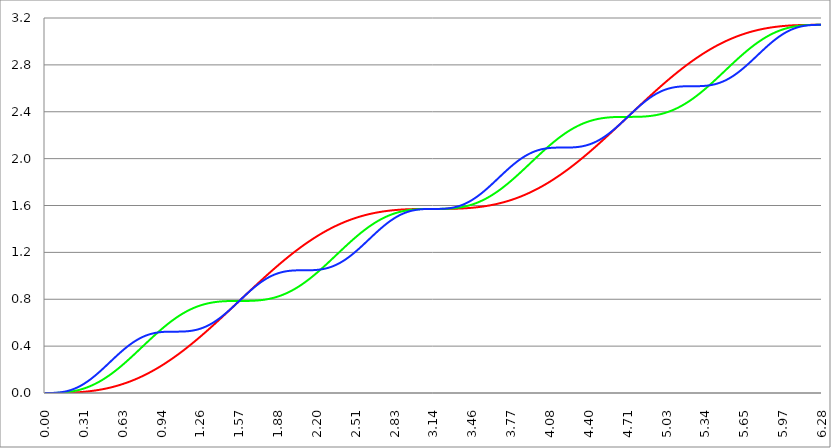
| Category | Series 1 | Series 0 | Series 2 |
|---|---|---|---|
| 0.0 | 0 | 0 | 0 |
| 0.00314159265358979 | 0 | 0 | 0 |
| 0.00628318530717958 | 0 | 0 | 0 |
| 0.00942477796076938 | 0 | 0 | 0 |
| 0.0125663706143592 | 0 | 0 | 0 |
| 0.015707963267949 | 0 | 0 | 0 |
| 0.0188495559215388 | 0 | 0 | 0 |
| 0.0219911485751285 | 0 | 0 | 0 |
| 0.0251327412287183 | 0 | 0 | 0 |
| 0.0282743338823081 | 0 | 0 | 0 |
| 0.0314159265358979 | 0 | 0 | 0 |
| 0.0345575191894877 | 0 | 0 | 0 |
| 0.0376991118430775 | 0 | 0 | 0 |
| 0.0408407044966673 | 0 | 0 | 0 |
| 0.0439822971502571 | 0 | 0 | 0 |
| 0.0471238898038469 | 0 | 0 | 0 |
| 0.0502654824574367 | 0 | 0 | 0 |
| 0.0534070751110265 | 0 | 0 | 0 |
| 0.0565486677646163 | 0 | 0 | 0.001 |
| 0.059690260418206 | 0 | 0 | 0.001 |
| 0.0628318530717958 | 0 | 0 | 0.001 |
| 0.0659734457253856 | 0 | 0 | 0.001 |
| 0.0691150383789754 | 0 | 0 | 0.001 |
| 0.0722566310325652 | 0 | 0.001 | 0.001 |
| 0.075398223686155 | 0 | 0.001 | 0.001 |
| 0.0785398163397448 | 0 | 0.001 | 0.001 |
| 0.0816814089933346 | 0 | 0.001 | 0.002 |
| 0.0848230016469244 | 0 | 0.001 | 0.002 |
| 0.0879645943005142 | 0 | 0.001 | 0.002 |
| 0.091106186954104 | 0 | 0.001 | 0.002 |
| 0.0942477796076937 | 0 | 0.001 | 0.002 |
| 0.0973893722612835 | 0 | 0.001 | 0.003 |
| 0.100530964914873 | 0 | 0.001 | 0.003 |
| 0.103672557568463 | 0 | 0.001 | 0.003 |
| 0.106814150222053 | 0 | 0.002 | 0.004 |
| 0.109955742875643 | 0 | 0.002 | 0.004 |
| 0.113097335529233 | 0 | 0.002 | 0.004 |
| 0.116238928182822 | 0.001 | 0.002 | 0.005 |
| 0.119380520836412 | 0.001 | 0.002 | 0.005 |
| 0.122522113490002 | 0.001 | 0.002 | 0.005 |
| 0.125663706143592 | 0.001 | 0.003 | 0.006 |
| 0.128805298797181 | 0.001 | 0.003 | 0.006 |
| 0.131946891450771 | 0.001 | 0.003 | 0.007 |
| 0.135088484104361 | 0.001 | 0.003 | 0.007 |
| 0.138230076757951 | 0.001 | 0.003 | 0.008 |
| 0.141371669411541 | 0.001 | 0.004 | 0.008 |
| 0.14451326206513 | 0.001 | 0.004 | 0.009 |
| 0.14765485471872 | 0.001 | 0.004 | 0.009 |
| 0.15079644737231 | 0.001 | 0.004 | 0.01 |
| 0.1539380400259 | 0.001 | 0.005 | 0.01 |
| 0.15707963267949 | 0.001 | 0.005 | 0.011 |
| 0.160221225333079 | 0.001 | 0.005 | 0.012 |
| 0.163362817986669 | 0.001 | 0.006 | 0.012 |
| 0.166504410640259 | 0.002 | 0.006 | 0.013 |
| 0.169646003293849 | 0.002 | 0.006 | 0.014 |
| 0.172787595947439 | 0.002 | 0.007 | 0.015 |
| 0.175929188601028 | 0.002 | 0.007 | 0.015 |
| 0.179070781254618 | 0.002 | 0.007 | 0.016 |
| 0.182212373908208 | 0.002 | 0.008 | 0.017 |
| 0.185353966561798 | 0.002 | 0.008 | 0.018 |
| 0.188495559215388 | 0.002 | 0.009 | 0.019 |
| 0.191637151868977 | 0.002 | 0.009 | 0.02 |
| 0.194778744522567 | 0.002 | 0.01 | 0.021 |
| 0.197920337176157 | 0.003 | 0.01 | 0.022 |
| 0.201061929829747 | 0.003 | 0.01 | 0.023 |
| 0.204203522483336 | 0.003 | 0.011 | 0.024 |
| 0.207345115136926 | 0.003 | 0.011 | 0.025 |
| 0.210486707790516 | 0.003 | 0.012 | 0.026 |
| 0.213628300444106 | 0.003 | 0.013 | 0.027 |
| 0.216769893097696 | 0.003 | 0.013 | 0.028 |
| 0.219911485751285 | 0.004 | 0.014 | 0.029 |
| 0.223053078404875 | 0.004 | 0.014 | 0.03 |
| 0.226194671058465 | 0.004 | 0.015 | 0.032 |
| 0.229336263712055 | 0.004 | 0.015 | 0.033 |
| 0.232477856365645 | 0.004 | 0.016 | 0.034 |
| 0.235619449019234 | 0.004 | 0.017 | 0.036 |
| 0.238761041672824 | 0.004 | 0.017 | 0.037 |
| 0.241902634326414 | 0.005 | 0.018 | 0.038 |
| 0.245044226980004 | 0.005 | 0.019 | 0.04 |
| 0.248185819633594 | 0.005 | 0.019 | 0.041 |
| 0.251327412287183 | 0.005 | 0.02 | 0.042 |
| 0.254469004940773 | 0.005 | 0.021 | 0.044 |
| 0.257610597594363 | 0.006 | 0.022 | 0.045 |
| 0.260752190247953 | 0.006 | 0.022 | 0.047 |
| 0.263893782901543 | 0.006 | 0.023 | 0.049 |
| 0.267035375555132 | 0.006 | 0.024 | 0.05 |
| 0.270176968208722 | 0.006 | 0.025 | 0.052 |
| 0.273318560862312 | 0.007 | 0.026 | 0.054 |
| 0.276460153515902 | 0.007 | 0.026 | 0.055 |
| 0.279601746169492 | 0.007 | 0.027 | 0.057 |
| 0.282743338823082 | 0.007 | 0.028 | 0.059 |
| 0.285884931476671 | 0.008 | 0.029 | 0.06 |
| 0.289026524130261 | 0.008 | 0.03 | 0.062 |
| 0.292168116783851 | 0.008 | 0.031 | 0.064 |
| 0.295309709437441 | 0.008 | 0.032 | 0.066 |
| 0.298451302091031 | 0.009 | 0.033 | 0.068 |
| 0.30159289474462 | 0.009 | 0.034 | 0.07 |
| 0.30473448739821 | 0.009 | 0.035 | 0.072 |
| 0.3078760800518 | 0.01 | 0.036 | 0.074 |
| 0.31101767270539 | 0.01 | 0.037 | 0.076 |
| 0.31415926535898 | 0.01 | 0.038 | 0.078 |
| 0.31730085801257 | 0.01 | 0.039 | 0.08 |
| 0.320442450666159 | 0.011 | 0.04 | 0.082 |
| 0.323584043319749 | 0.011 | 0.042 | 0.084 |
| 0.326725635973339 | 0.011 | 0.043 | 0.086 |
| 0.329867228626929 | 0.012 | 0.044 | 0.088 |
| 0.333008821280519 | 0.012 | 0.045 | 0.091 |
| 0.336150413934108 | 0.012 | 0.046 | 0.093 |
| 0.339292006587698 | 0.013 | 0.047 | 0.095 |
| 0.342433599241288 | 0.013 | 0.049 | 0.097 |
| 0.345575191894878 | 0.013 | 0.05 | 0.1 |
| 0.348716784548468 | 0.014 | 0.051 | 0.102 |
| 0.351858377202058 | 0.014 | 0.053 | 0.104 |
| 0.354999969855647 | 0.015 | 0.054 | 0.107 |
| 0.358141562509237 | 0.015 | 0.055 | 0.109 |
| 0.361283155162827 | 0.015 | 0.057 | 0.112 |
| 0.364424747816417 | 0.016 | 0.058 | 0.114 |
| 0.367566340470007 | 0.016 | 0.059 | 0.117 |
| 0.370707933123597 | 0.017 | 0.061 | 0.119 |
| 0.373849525777186 | 0.017 | 0.062 | 0.122 |
| 0.376991118430776 | 0.017 | 0.064 | 0.124 |
| 0.380132711084366 | 0.018 | 0.065 | 0.127 |
| 0.383274303737956 | 0.018 | 0.067 | 0.129 |
| 0.386415896391546 | 0.019 | 0.068 | 0.132 |
| 0.389557489045135 | 0.019 | 0.07 | 0.135 |
| 0.392699081698725 | 0.02 | 0.071 | 0.137 |
| 0.395840674352315 | 0.02 | 0.073 | 0.14 |
| 0.398982267005905 | 0.021 | 0.075 | 0.143 |
| 0.402123859659495 | 0.021 | 0.076 | 0.146 |
| 0.405265452313085 | 0.021 | 0.078 | 0.148 |
| 0.408407044966674 | 0.022 | 0.079 | 0.151 |
| 0.411548637620264 | 0.022 | 0.081 | 0.154 |
| 0.414690230273854 | 0.023 | 0.083 | 0.157 |
| 0.417831822927444 | 0.023 | 0.085 | 0.16 |
| 0.420973415581034 | 0.024 | 0.086 | 0.162 |
| 0.424115008234623 | 0.025 | 0.088 | 0.165 |
| 0.427256600888213 | 0.025 | 0.09 | 0.168 |
| 0.430398193541803 | 0.026 | 0.092 | 0.171 |
| 0.433539786195393 | 0.026 | 0.093 | 0.174 |
| 0.436681378848983 | 0.027 | 0.095 | 0.177 |
| 0.439822971502573 | 0.027 | 0.097 | 0.18 |
| 0.442964564156162 | 0.028 | 0.099 | 0.183 |
| 0.446106156809752 | 0.028 | 0.101 | 0.186 |
| 0.449247749463342 | 0.029 | 0.103 | 0.189 |
| 0.452389342116932 | 0.03 | 0.105 | 0.192 |
| 0.455530934770522 | 0.03 | 0.107 | 0.195 |
| 0.458672527424111 | 0.031 | 0.109 | 0.198 |
| 0.461814120077701 | 0.031 | 0.111 | 0.201 |
| 0.464955712731291 | 0.032 | 0.113 | 0.204 |
| 0.468097305384881 | 0.033 | 0.115 | 0.207 |
| 0.471238898038471 | 0.033 | 0.117 | 0.21 |
| 0.474380490692061 | 0.034 | 0.119 | 0.213 |
| 0.47752208334565 | 0.035 | 0.121 | 0.216 |
| 0.48066367599924 | 0.035 | 0.123 | 0.219 |
| 0.48380526865283 | 0.036 | 0.125 | 0.222 |
| 0.48694686130642 | 0.037 | 0.127 | 0.225 |
| 0.49008845396001 | 0.037 | 0.129 | 0.228 |
| 0.493230046613599 | 0.038 | 0.132 | 0.232 |
| 0.496371639267189 | 0.039 | 0.134 | 0.235 |
| 0.499513231920779 | 0.04 | 0.136 | 0.238 |
| 0.502654824574369 | 0.04 | 0.138 | 0.241 |
| 0.505796417227959 | 0.041 | 0.14 | 0.244 |
| 0.508938009881549 | 0.042 | 0.143 | 0.247 |
| 0.512079602535138 | 0.042 | 0.145 | 0.25 |
| 0.515221195188728 | 0.043 | 0.147 | 0.253 |
| 0.518362787842318 | 0.044 | 0.15 | 0.257 |
| 0.521504380495908 | 0.045 | 0.152 | 0.26 |
| 0.524645973149498 | 0.046 | 0.154 | 0.263 |
| 0.527787565803087 | 0.046 | 0.157 | 0.266 |
| 0.530929158456677 | 0.047 | 0.159 | 0.269 |
| 0.534070751110267 | 0.048 | 0.161 | 0.272 |
| 0.537212343763857 | 0.049 | 0.164 | 0.275 |
| 0.540353936417447 | 0.05 | 0.166 | 0.279 |
| 0.543495529071037 | 0.05 | 0.169 | 0.282 |
| 0.546637121724626 | 0.051 | 0.171 | 0.285 |
| 0.549778714378216 | 0.052 | 0.174 | 0.288 |
| 0.552920307031806 | 0.053 | 0.176 | 0.291 |
| 0.556061899685396 | 0.054 | 0.179 | 0.294 |
| 0.559203492338986 | 0.055 | 0.181 | 0.297 |
| 0.562345084992576 | 0.056 | 0.184 | 0.3 |
| 0.565486677646165 | 0.057 | 0.186 | 0.303 |
| 0.568628270299755 | 0.057 | 0.189 | 0.307 |
| 0.571769862953345 | 0.058 | 0.192 | 0.31 |
| 0.574911455606935 | 0.059 | 0.194 | 0.313 |
| 0.578053048260525 | 0.06 | 0.197 | 0.316 |
| 0.581194640914114 | 0.061 | 0.199 | 0.319 |
| 0.584336233567704 | 0.062 | 0.202 | 0.322 |
| 0.587477826221294 | 0.063 | 0.205 | 0.325 |
| 0.590619418874884 | 0.064 | 0.207 | 0.328 |
| 0.593761011528474 | 0.065 | 0.21 | 0.331 |
| 0.596902604182064 | 0.066 | 0.213 | 0.334 |
| 0.600044196835653 | 0.067 | 0.216 | 0.337 |
| 0.603185789489243 | 0.068 | 0.218 | 0.34 |
| 0.606327382142833 | 0.069 | 0.221 | 0.343 |
| 0.609468974796423 | 0.07 | 0.224 | 0.346 |
| 0.612610567450013 | 0.071 | 0.227 | 0.349 |
| 0.615752160103602 | 0.072 | 0.229 | 0.352 |
| 0.618893752757192 | 0.073 | 0.232 | 0.355 |
| 0.622035345410782 | 0.074 | 0.235 | 0.357 |
| 0.625176938064372 | 0.075 | 0.238 | 0.36 |
| 0.628318530717962 | 0.076 | 0.241 | 0.363 |
| 0.631460123371551 | 0.077 | 0.244 | 0.366 |
| 0.634601716025141 | 0.079 | 0.246 | 0.369 |
| 0.637743308678731 | 0.08 | 0.249 | 0.372 |
| 0.640884901332321 | 0.081 | 0.252 | 0.374 |
| 0.644026493985911 | 0.082 | 0.255 | 0.377 |
| 0.647168086639501 | 0.083 | 0.258 | 0.38 |
| 0.65030967929309 | 0.084 | 0.261 | 0.383 |
| 0.65345127194668 | 0.085 | 0.264 | 0.385 |
| 0.65659286460027 | 0.087 | 0.267 | 0.388 |
| 0.65973445725386 | 0.088 | 0.27 | 0.391 |
| 0.66287604990745 | 0.089 | 0.273 | 0.393 |
| 0.666017642561039 | 0.09 | 0.276 | 0.396 |
| 0.669159235214629 | 0.091 | 0.279 | 0.398 |
| 0.672300827868219 | 0.093 | 0.282 | 0.401 |
| 0.675442420521809 | 0.094 | 0.284 | 0.404 |
| 0.678584013175399 | 0.095 | 0.287 | 0.406 |
| 0.681725605828989 | 0.096 | 0.29 | 0.409 |
| 0.684867198482578 | 0.097 | 0.294 | 0.411 |
| 0.688008791136168 | 0.099 | 0.297 | 0.414 |
| 0.691150383789758 | 0.1 | 0.3 | 0.416 |
| 0.694291976443348 | 0.101 | 0.303 | 0.418 |
| 0.697433569096938 | 0.103 | 0.306 | 0.421 |
| 0.700575161750528 | 0.104 | 0.309 | 0.423 |
| 0.703716754404117 | 0.105 | 0.312 | 0.425 |
| 0.706858347057707 | 0.107 | 0.315 | 0.428 |
| 0.709999939711297 | 0.108 | 0.318 | 0.43 |
| 0.713141532364887 | 0.109 | 0.321 | 0.432 |
| 0.716283125018477 | 0.111 | 0.324 | 0.434 |
| 0.719424717672066 | 0.112 | 0.327 | 0.437 |
| 0.722566310325656 | 0.113 | 0.33 | 0.439 |
| 0.725707902979246 | 0.115 | 0.333 | 0.441 |
| 0.728849495632836 | 0.116 | 0.336 | 0.443 |
| 0.731991088286426 | 0.117 | 0.339 | 0.445 |
| 0.735132680940016 | 0.119 | 0.343 | 0.447 |
| 0.738274273593605 | 0.12 | 0.346 | 0.449 |
| 0.741415866247195 | 0.122 | 0.349 | 0.451 |
| 0.744557458900785 | 0.123 | 0.352 | 0.453 |
| 0.747699051554375 | 0.125 | 0.355 | 0.455 |
| 0.750840644207965 | 0.126 | 0.358 | 0.457 |
| 0.753982236861554 | 0.127 | 0.361 | 0.459 |
| 0.757123829515144 | 0.129 | 0.364 | 0.461 |
| 0.760265422168734 | 0.13 | 0.368 | 0.463 |
| 0.763407014822324 | 0.132 | 0.371 | 0.464 |
| 0.766548607475914 | 0.133 | 0.374 | 0.466 |
| 0.769690200129504 | 0.135 | 0.377 | 0.468 |
| 0.772831792783093 | 0.136 | 0.38 | 0.47 |
| 0.775973385436683 | 0.138 | 0.383 | 0.471 |
| 0.779114978090273 | 0.14 | 0.386 | 0.473 |
| 0.782256570743863 | 0.141 | 0.39 | 0.474 |
| 0.785398163397453 | 0.143 | 0.393 | 0.476 |
| 0.788539756051042 | 0.144 | 0.396 | 0.478 |
| 0.791681348704632 | 0.146 | 0.399 | 0.479 |
| 0.794822941358222 | 0.147 | 0.402 | 0.481 |
| 0.797964534011812 | 0.149 | 0.405 | 0.482 |
| 0.801106126665402 | 0.151 | 0.408 | 0.484 |
| 0.804247719318992 | 0.152 | 0.412 | 0.485 |
| 0.807389311972581 | 0.154 | 0.415 | 0.486 |
| 0.810530904626171 | 0.156 | 0.418 | 0.488 |
| 0.813672497279761 | 0.157 | 0.421 | 0.489 |
| 0.816814089933351 | 0.159 | 0.424 | 0.49 |
| 0.819955682586941 | 0.161 | 0.427 | 0.492 |
| 0.823097275240531 | 0.162 | 0.43 | 0.493 |
| 0.82623886789412 | 0.164 | 0.433 | 0.494 |
| 0.82938046054771 | 0.166 | 0.437 | 0.495 |
| 0.8325220532013 | 0.167 | 0.44 | 0.496 |
| 0.83566364585489 | 0.169 | 0.443 | 0.497 |
| 0.83880523850848 | 0.171 | 0.446 | 0.498 |
| 0.841946831162069 | 0.173 | 0.449 | 0.5 |
| 0.845088423815659 | 0.174 | 0.452 | 0.501 |
| 0.848230016469249 | 0.176 | 0.455 | 0.502 |
| 0.851371609122839 | 0.178 | 0.458 | 0.503 |
| 0.854513201776429 | 0.18 | 0.461 | 0.504 |
| 0.857654794430019 | 0.181 | 0.464 | 0.504 |
| 0.860796387083608 | 0.183 | 0.468 | 0.505 |
| 0.863937979737198 | 0.185 | 0.471 | 0.506 |
| 0.867079572390788 | 0.187 | 0.474 | 0.507 |
| 0.870221165044378 | 0.189 | 0.477 | 0.508 |
| 0.873362757697968 | 0.191 | 0.48 | 0.509 |
| 0.876504350351557 | 0.192 | 0.483 | 0.509 |
| 0.879645943005147 | 0.194 | 0.486 | 0.51 |
| 0.882787535658737 | 0.196 | 0.489 | 0.511 |
| 0.885929128312327 | 0.198 | 0.492 | 0.512 |
| 0.889070720965917 | 0.2 | 0.495 | 0.512 |
| 0.892212313619507 | 0.202 | 0.498 | 0.513 |
| 0.895353906273096 | 0.204 | 0.501 | 0.514 |
| 0.898495498926686 | 0.206 | 0.504 | 0.514 |
| 0.901637091580276 | 0.208 | 0.507 | 0.515 |
| 0.904778684233866 | 0.209 | 0.51 | 0.515 |
| 0.907920276887456 | 0.211 | 0.513 | 0.516 |
| 0.911061869541045 | 0.213 | 0.516 | 0.516 |
| 0.914203462194635 | 0.215 | 0.519 | 0.517 |
| 0.917345054848225 | 0.217 | 0.522 | 0.517 |
| 0.920486647501815 | 0.219 | 0.525 | 0.518 |
| 0.923628240155405 | 0.221 | 0.527 | 0.518 |
| 0.926769832808995 | 0.223 | 0.53 | 0.518 |
| 0.929911425462584 | 0.225 | 0.533 | 0.519 |
| 0.933053018116174 | 0.227 | 0.536 | 0.519 |
| 0.936194610769764 | 0.229 | 0.539 | 0.52 |
| 0.939336203423354 | 0.231 | 0.542 | 0.52 |
| 0.942477796076944 | 0.233 | 0.545 | 0.52 |
| 0.945619388730533 | 0.236 | 0.548 | 0.521 |
| 0.948760981384123 | 0.238 | 0.55 | 0.521 |
| 0.951902574037713 | 0.24 | 0.553 | 0.521 |
| 0.955044166691303 | 0.242 | 0.556 | 0.521 |
| 0.958185759344893 | 0.244 | 0.559 | 0.522 |
| 0.961327351998483 | 0.246 | 0.562 | 0.522 |
| 0.964468944652072 | 0.248 | 0.564 | 0.522 |
| 0.967610537305662 | 0.25 | 0.567 | 0.522 |
| 0.970752129959252 | 0.252 | 0.57 | 0.522 |
| 0.973893722612842 | 0.255 | 0.573 | 0.522 |
| 0.977035315266432 | 0.257 | 0.575 | 0.523 |
| 0.980176907920022 | 0.259 | 0.578 | 0.523 |
| 0.983318500573611 | 0.261 | 0.581 | 0.523 |
| 0.986460093227201 | 0.263 | 0.583 | 0.523 |
| 0.989601685880791 | 0.265 | 0.586 | 0.523 |
| 0.992743278534381 | 0.268 | 0.589 | 0.523 |
| 0.995884871187971 | 0.27 | 0.591 | 0.523 |
| 0.99902646384156 | 0.272 | 0.594 | 0.523 |
| 1.00216805649515 | 0.274 | 0.596 | 0.523 |
| 1.00530964914874 | 0.276 | 0.599 | 0.523 |
| 1.00845124180233 | 0.279 | 0.602 | 0.523 |
| 1.01159283445592 | 0.281 | 0.604 | 0.523 |
| 1.01473442710951 | 0.283 | 0.607 | 0.523 |
| 1.017876019763099 | 0.285 | 0.609 | 0.524 |
| 1.021017612416689 | 0.288 | 0.612 | 0.524 |
| 1.02415920507028 | 0.29 | 0.614 | 0.524 |
| 1.027300797723869 | 0.292 | 0.617 | 0.524 |
| 1.030442390377459 | 0.295 | 0.619 | 0.524 |
| 1.033583983031048 | 0.297 | 0.621 | 0.524 |
| 1.036725575684638 | 0.299 | 0.624 | 0.524 |
| 1.039867168338228 | 0.302 | 0.626 | 0.524 |
| 1.043008760991818 | 0.304 | 0.629 | 0.524 |
| 1.046150353645408 | 0.306 | 0.631 | 0.524 |
| 1.049291946298998 | 0.309 | 0.633 | 0.524 |
| 1.052433538952587 | 0.311 | 0.636 | 0.524 |
| 1.055575131606177 | 0.313 | 0.638 | 0.524 |
| 1.058716724259767 | 0.316 | 0.64 | 0.524 |
| 1.061858316913357 | 0.318 | 0.643 | 0.524 |
| 1.064999909566947 | 0.321 | 0.645 | 0.524 |
| 1.068141502220536 | 0.323 | 0.647 | 0.524 |
| 1.071283094874126 | 0.325 | 0.649 | 0.524 |
| 1.074424687527716 | 0.328 | 0.652 | 0.524 |
| 1.077566280181306 | 0.33 | 0.654 | 0.524 |
| 1.080707872834896 | 0.333 | 0.656 | 0.524 |
| 1.083849465488486 | 0.335 | 0.658 | 0.524 |
| 1.086991058142075 | 0.338 | 0.66 | 0.524 |
| 1.090132650795665 | 0.34 | 0.662 | 0.524 |
| 1.093274243449255 | 0.343 | 0.665 | 0.524 |
| 1.096415836102845 | 0.345 | 0.667 | 0.524 |
| 1.099557428756435 | 0.348 | 0.669 | 0.524 |
| 1.102699021410025 | 0.35 | 0.671 | 0.524 |
| 1.105840614063614 | 0.353 | 0.673 | 0.524 |
| 1.108982206717204 | 0.355 | 0.675 | 0.524 |
| 1.112123799370794 | 0.358 | 0.677 | 0.524 |
| 1.115265392024384 | 0.36 | 0.679 | 0.525 |
| 1.118406984677974 | 0.363 | 0.681 | 0.525 |
| 1.121548577331563 | 0.365 | 0.683 | 0.525 |
| 1.124690169985153 | 0.368 | 0.685 | 0.525 |
| 1.127831762638743 | 0.37 | 0.686 | 0.525 |
| 1.130973355292333 | 0.373 | 0.688 | 0.525 |
| 1.134114947945923 | 0.375 | 0.69 | 0.526 |
| 1.137256540599513 | 0.378 | 0.692 | 0.526 |
| 1.140398133253102 | 0.381 | 0.694 | 0.526 |
| 1.143539725906692 | 0.383 | 0.696 | 0.526 |
| 1.146681318560282 | 0.386 | 0.697 | 0.527 |
| 1.149822911213872 | 0.388 | 0.699 | 0.527 |
| 1.152964503867462 | 0.391 | 0.701 | 0.527 |
| 1.156106096521051 | 0.394 | 0.703 | 0.527 |
| 1.159247689174641 | 0.396 | 0.704 | 0.528 |
| 1.162389281828231 | 0.399 | 0.706 | 0.528 |
| 1.165530874481821 | 0.402 | 0.708 | 0.528 |
| 1.168672467135411 | 0.404 | 0.709 | 0.529 |
| 1.171814059789001 | 0.407 | 0.711 | 0.529 |
| 1.17495565244259 | 0.41 | 0.712 | 0.53 |
| 1.17809724509618 | 0.412 | 0.714 | 0.53 |
| 1.18123883774977 | 0.415 | 0.716 | 0.531 |
| 1.18438043040336 | 0.418 | 0.717 | 0.531 |
| 1.18752202305695 | 0.42 | 0.719 | 0.532 |
| 1.190663615710539 | 0.423 | 0.72 | 0.532 |
| 1.193805208364129 | 0.426 | 0.722 | 0.533 |
| 1.19694680101772 | 0.428 | 0.723 | 0.533 |
| 1.200088393671309 | 0.431 | 0.725 | 0.534 |
| 1.203229986324899 | 0.434 | 0.726 | 0.535 |
| 1.206371578978489 | 0.437 | 0.727 | 0.535 |
| 1.209513171632078 | 0.439 | 0.729 | 0.536 |
| 1.212654764285668 | 0.442 | 0.73 | 0.537 |
| 1.215796356939258 | 0.445 | 0.731 | 0.537 |
| 1.218937949592848 | 0.448 | 0.733 | 0.538 |
| 1.222079542246438 | 0.45 | 0.734 | 0.539 |
| 1.225221134900027 | 0.453 | 0.735 | 0.54 |
| 1.228362727553617 | 0.456 | 0.737 | 0.54 |
| 1.231504320207207 | 0.459 | 0.738 | 0.541 |
| 1.234645912860797 | 0.462 | 0.739 | 0.542 |
| 1.237787505514387 | 0.464 | 0.74 | 0.543 |
| 1.240929098167977 | 0.467 | 0.742 | 0.544 |
| 1.244070690821566 | 0.47 | 0.743 | 0.545 |
| 1.247212283475156 | 0.473 | 0.744 | 0.546 |
| 1.250353876128746 | 0.476 | 0.745 | 0.547 |
| 1.253495468782336 | 0.479 | 0.746 | 0.548 |
| 1.256637061435926 | 0.481 | 0.747 | 0.549 |
| 1.259778654089515 | 0.484 | 0.748 | 0.55 |
| 1.262920246743105 | 0.487 | 0.749 | 0.551 |
| 1.266061839396695 | 0.49 | 0.75 | 0.552 |
| 1.269203432050285 | 0.493 | 0.751 | 0.554 |
| 1.272345024703875 | 0.496 | 0.752 | 0.555 |
| 1.275486617357465 | 0.499 | 0.753 | 0.556 |
| 1.278628210011054 | 0.501 | 0.754 | 0.557 |
| 1.281769802664644 | 0.504 | 0.755 | 0.559 |
| 1.284911395318234 | 0.507 | 0.756 | 0.56 |
| 1.288052987971824 | 0.51 | 0.757 | 0.561 |
| 1.291194580625414 | 0.513 | 0.758 | 0.563 |
| 1.294336173279003 | 0.516 | 0.759 | 0.564 |
| 1.297477765932593 | 0.519 | 0.76 | 0.566 |
| 1.300619358586183 | 0.522 | 0.761 | 0.567 |
| 1.303760951239773 | 0.525 | 0.761 | 0.569 |
| 1.306902543893363 | 0.528 | 0.762 | 0.57 |
| 1.310044136546953 | 0.53 | 0.763 | 0.572 |
| 1.313185729200542 | 0.533 | 0.764 | 0.573 |
| 1.316327321854132 | 0.536 | 0.765 | 0.575 |
| 1.319468914507722 | 0.539 | 0.765 | 0.577 |
| 1.322610507161312 | 0.542 | 0.766 | 0.578 |
| 1.325752099814902 | 0.545 | 0.767 | 0.58 |
| 1.328893692468491 | 0.548 | 0.767 | 0.582 |
| 1.332035285122081 | 0.551 | 0.768 | 0.583 |
| 1.335176877775671 | 0.554 | 0.769 | 0.585 |
| 1.338318470429261 | 0.557 | 0.769 | 0.587 |
| 1.341460063082851 | 0.56 | 0.77 | 0.589 |
| 1.344601655736441 | 0.563 | 0.771 | 0.591 |
| 1.34774324839003 | 0.566 | 0.771 | 0.593 |
| 1.35088484104362 | 0.569 | 0.772 | 0.595 |
| 1.35402643369721 | 0.572 | 0.772 | 0.597 |
| 1.3571680263508 | 0.575 | 0.773 | 0.599 |
| 1.36030961900439 | 0.578 | 0.773 | 0.601 |
| 1.363451211657979 | 0.581 | 0.774 | 0.603 |
| 1.36659280431157 | 0.584 | 0.774 | 0.605 |
| 1.369734396965159 | 0.587 | 0.775 | 0.607 |
| 1.372875989618749 | 0.59 | 0.775 | 0.609 |
| 1.376017582272339 | 0.593 | 0.776 | 0.611 |
| 1.379159174925929 | 0.596 | 0.776 | 0.614 |
| 1.382300767579518 | 0.599 | 0.777 | 0.616 |
| 1.385442360233108 | 0.602 | 0.777 | 0.618 |
| 1.388583952886698 | 0.605 | 0.778 | 0.62 |
| 1.391725545540288 | 0.608 | 0.778 | 0.623 |
| 1.394867138193878 | 0.611 | 0.778 | 0.625 |
| 1.398008730847468 | 0.614 | 0.779 | 0.627 |
| 1.401150323501057 | 0.617 | 0.779 | 0.63 |
| 1.404291916154647 | 0.62 | 0.779 | 0.632 |
| 1.407433508808237 | 0.623 | 0.78 | 0.635 |
| 1.410575101461827 | 0.627 | 0.78 | 0.637 |
| 1.413716694115417 | 0.63 | 0.78 | 0.639 |
| 1.416858286769006 | 0.633 | 0.781 | 0.642 |
| 1.419999879422596 | 0.636 | 0.781 | 0.644 |
| 1.423141472076186 | 0.639 | 0.781 | 0.647 |
| 1.426283064729776 | 0.642 | 0.781 | 0.65 |
| 1.429424657383366 | 0.645 | 0.782 | 0.652 |
| 1.432566250036956 | 0.648 | 0.782 | 0.655 |
| 1.435707842690545 | 0.651 | 0.782 | 0.657 |
| 1.438849435344135 | 0.654 | 0.782 | 0.66 |
| 1.441991027997725 | 0.657 | 0.783 | 0.663 |
| 1.445132620651315 | 0.66 | 0.783 | 0.666 |
| 1.448274213304905 | 0.663 | 0.783 | 0.668 |
| 1.451415805958494 | 0.667 | 0.783 | 0.671 |
| 1.454557398612084 | 0.67 | 0.783 | 0.674 |
| 1.457698991265674 | 0.673 | 0.783 | 0.677 |
| 1.460840583919264 | 0.676 | 0.784 | 0.679 |
| 1.463982176572854 | 0.679 | 0.784 | 0.682 |
| 1.467123769226444 | 0.682 | 0.784 | 0.685 |
| 1.470265361880033 | 0.685 | 0.784 | 0.688 |
| 1.473406954533623 | 0.688 | 0.784 | 0.691 |
| 1.476548547187213 | 0.691 | 0.784 | 0.694 |
| 1.479690139840803 | 0.695 | 0.784 | 0.697 |
| 1.482831732494393 | 0.698 | 0.784 | 0.699 |
| 1.485973325147982 | 0.701 | 0.785 | 0.702 |
| 1.489114917801572 | 0.704 | 0.785 | 0.705 |
| 1.492256510455162 | 0.707 | 0.785 | 0.708 |
| 1.495398103108752 | 0.71 | 0.785 | 0.711 |
| 1.498539695762342 | 0.713 | 0.785 | 0.714 |
| 1.501681288415932 | 0.716 | 0.785 | 0.717 |
| 1.504822881069521 | 0.72 | 0.785 | 0.72 |
| 1.507964473723111 | 0.723 | 0.785 | 0.723 |
| 1.511106066376701 | 0.726 | 0.785 | 0.726 |
| 1.514247659030291 | 0.729 | 0.785 | 0.729 |
| 1.517389251683881 | 0.732 | 0.785 | 0.732 |
| 1.520530844337471 | 0.735 | 0.785 | 0.736 |
| 1.52367243699106 | 0.738 | 0.785 | 0.739 |
| 1.52681402964465 | 0.741 | 0.785 | 0.742 |
| 1.52995562229824 | 0.745 | 0.785 | 0.745 |
| 1.53309721495183 | 0.748 | 0.785 | 0.748 |
| 1.53623880760542 | 0.751 | 0.785 | 0.751 |
| 1.539380400259009 | 0.754 | 0.785 | 0.754 |
| 1.542521992912599 | 0.757 | 0.785 | 0.757 |
| 1.545663585566189 | 0.76 | 0.785 | 0.76 |
| 1.548805178219779 | 0.763 | 0.785 | 0.763 |
| 1.551946770873369 | 0.767 | 0.785 | 0.767 |
| 1.555088363526959 | 0.77 | 0.785 | 0.77 |
| 1.558229956180548 | 0.773 | 0.785 | 0.773 |
| 1.561371548834138 | 0.776 | 0.785 | 0.776 |
| 1.564513141487728 | 0.779 | 0.785 | 0.779 |
| 1.567654734141318 | 0.782 | 0.785 | 0.782 |
| 1.570796326794908 | 0.785 | 0.785 | 0.785 |
| 1.573937919448497 | 0.789 | 0.785 | 0.789 |
| 1.577079512102087 | 0.792 | 0.785 | 0.792 |
| 1.580221104755677 | 0.795 | 0.785 | 0.795 |
| 1.583362697409267 | 0.798 | 0.785 | 0.798 |
| 1.586504290062857 | 0.801 | 0.785 | 0.801 |
| 1.589645882716447 | 0.804 | 0.785 | 0.804 |
| 1.592787475370036 | 0.807 | 0.785 | 0.807 |
| 1.595929068023626 | 0.811 | 0.785 | 0.81 |
| 1.599070660677216 | 0.814 | 0.785 | 0.814 |
| 1.602212253330806 | 0.817 | 0.785 | 0.817 |
| 1.605353845984396 | 0.82 | 0.785 | 0.82 |
| 1.608495438637985 | 0.823 | 0.785 | 0.823 |
| 1.611637031291575 | 0.826 | 0.785 | 0.826 |
| 1.614778623945165 | 0.829 | 0.786 | 0.829 |
| 1.617920216598755 | 0.832 | 0.786 | 0.832 |
| 1.621061809252345 | 0.836 | 0.786 | 0.835 |
| 1.624203401905935 | 0.839 | 0.786 | 0.838 |
| 1.627344994559524 | 0.842 | 0.786 | 0.841 |
| 1.630486587213114 | 0.845 | 0.786 | 0.844 |
| 1.633628179866704 | 0.848 | 0.786 | 0.847 |
| 1.636769772520294 | 0.851 | 0.786 | 0.851 |
| 1.639911365173884 | 0.854 | 0.786 | 0.854 |
| 1.643052957827473 | 0.858 | 0.786 | 0.857 |
| 1.646194550481063 | 0.861 | 0.786 | 0.86 |
| 1.649336143134653 | 0.864 | 0.786 | 0.863 |
| 1.652477735788243 | 0.867 | 0.786 | 0.865 |
| 1.655619328441833 | 0.87 | 0.786 | 0.868 |
| 1.658760921095423 | 0.873 | 0.786 | 0.871 |
| 1.661902513749012 | 0.876 | 0.786 | 0.874 |
| 1.665044106402602 | 0.879 | 0.787 | 0.877 |
| 1.668185699056192 | 0.882 | 0.787 | 0.88 |
| 1.671327291709782 | 0.886 | 0.787 | 0.883 |
| 1.674468884363372 | 0.889 | 0.787 | 0.886 |
| 1.677610477016961 | 0.892 | 0.787 | 0.889 |
| 1.680752069670551 | 0.895 | 0.787 | 0.891 |
| 1.683893662324141 | 0.898 | 0.787 | 0.894 |
| 1.687035254977731 | 0.901 | 0.787 | 0.897 |
| 1.690176847631321 | 0.904 | 0.788 | 0.9 |
| 1.693318440284911 | 0.907 | 0.788 | 0.903 |
| 1.6964600329385 | 0.91 | 0.788 | 0.905 |
| 1.69960162559209 | 0.913 | 0.788 | 0.908 |
| 1.70274321824568 | 0.917 | 0.788 | 0.911 |
| 1.70588481089927 | 0.92 | 0.789 | 0.913 |
| 1.70902640355286 | 0.923 | 0.789 | 0.916 |
| 1.712167996206449 | 0.926 | 0.789 | 0.919 |
| 1.715309588860039 | 0.929 | 0.789 | 0.921 |
| 1.71845118151363 | 0.932 | 0.79 | 0.924 |
| 1.721592774167219 | 0.935 | 0.79 | 0.926 |
| 1.724734366820809 | 0.938 | 0.79 | 0.929 |
| 1.727875959474399 | 0.941 | 0.79 | 0.931 |
| 1.731017552127988 | 0.944 | 0.791 | 0.934 |
| 1.734159144781578 | 0.947 | 0.791 | 0.936 |
| 1.737300737435168 | 0.95 | 0.791 | 0.939 |
| 1.740442330088758 | 0.953 | 0.792 | 0.941 |
| 1.743583922742348 | 0.956 | 0.792 | 0.944 |
| 1.746725515395937 | 0.96 | 0.792 | 0.946 |
| 1.749867108049527 | 0.963 | 0.793 | 0.948 |
| 1.753008700703117 | 0.966 | 0.793 | 0.951 |
| 1.756150293356707 | 0.969 | 0.794 | 0.953 |
| 1.759291886010297 | 0.972 | 0.794 | 0.955 |
| 1.762433478663887 | 0.975 | 0.795 | 0.957 |
| 1.765575071317476 | 0.978 | 0.795 | 0.959 |
| 1.768716663971066 | 0.981 | 0.795 | 0.962 |
| 1.771858256624656 | 0.984 | 0.796 | 0.964 |
| 1.774999849278246 | 0.987 | 0.796 | 0.966 |
| 1.778141441931836 | 0.99 | 0.797 | 0.968 |
| 1.781283034585426 | 0.993 | 0.797 | 0.97 |
| 1.784424627239015 | 0.996 | 0.798 | 0.972 |
| 1.787566219892605 | 0.999 | 0.798 | 0.974 |
| 1.790707812546195 | 1.002 | 0.799 | 0.976 |
| 1.793849405199785 | 1.005 | 0.8 | 0.978 |
| 1.796990997853375 | 1.008 | 0.8 | 0.98 |
| 1.800132590506964 | 1.011 | 0.801 | 0.982 |
| 1.803274183160554 | 1.014 | 0.801 | 0.984 |
| 1.806415775814144 | 1.017 | 0.802 | 0.986 |
| 1.809557368467734 | 1.02 | 0.803 | 0.987 |
| 1.812698961121324 | 1.023 | 0.803 | 0.989 |
| 1.815840553774914 | 1.026 | 0.804 | 0.991 |
| 1.818982146428503 | 1.029 | 0.805 | 0.993 |
| 1.822123739082093 | 1.032 | 0.806 | 0.994 |
| 1.825265331735683 | 1.034 | 0.806 | 0.996 |
| 1.828406924389273 | 1.037 | 0.807 | 0.998 |
| 1.831548517042863 | 1.04 | 0.808 | 0.999 |
| 1.834690109696452 | 1.043 | 0.809 | 1.001 |
| 1.837831702350042 | 1.046 | 0.809 | 1.002 |
| 1.840973295003632 | 1.049 | 0.81 | 1.004 |
| 1.844114887657222 | 1.052 | 0.811 | 1.005 |
| 1.847256480310812 | 1.055 | 0.812 | 1.007 |
| 1.850398072964402 | 1.058 | 0.813 | 1.008 |
| 1.853539665617991 | 1.061 | 0.814 | 1.009 |
| 1.856681258271581 | 1.064 | 0.815 | 1.011 |
| 1.859822850925171 | 1.067 | 0.816 | 1.012 |
| 1.862964443578761 | 1.069 | 0.816 | 1.013 |
| 1.866106036232351 | 1.072 | 0.817 | 1.015 |
| 1.86924762888594 | 1.075 | 0.818 | 1.016 |
| 1.87238922153953 | 1.078 | 0.819 | 1.017 |
| 1.87553081419312 | 1.081 | 0.82 | 1.018 |
| 1.87867240684671 | 1.084 | 0.821 | 1.02 |
| 1.8818139995003 | 1.087 | 0.823 | 1.021 |
| 1.88495559215389 | 1.089 | 0.824 | 1.022 |
| 1.888097184807479 | 1.092 | 0.825 | 1.023 |
| 1.891238777461069 | 1.095 | 0.826 | 1.024 |
| 1.89438037011466 | 1.098 | 0.827 | 1.025 |
| 1.897521962768249 | 1.101 | 0.828 | 1.026 |
| 1.900663555421839 | 1.104 | 0.829 | 1.027 |
| 1.903805148075429 | 1.106 | 0.83 | 1.028 |
| 1.906946740729018 | 1.109 | 0.832 | 1.029 |
| 1.910088333382608 | 1.112 | 0.833 | 1.03 |
| 1.913229926036198 | 1.115 | 0.834 | 1.03 |
| 1.916371518689788 | 1.118 | 0.835 | 1.031 |
| 1.919513111343378 | 1.12 | 0.837 | 1.032 |
| 1.922654703996967 | 1.123 | 0.838 | 1.033 |
| 1.925796296650557 | 1.126 | 0.839 | 1.034 |
| 1.928937889304147 | 1.129 | 0.841 | 1.034 |
| 1.932079481957737 | 1.131 | 0.842 | 1.035 |
| 1.935221074611327 | 1.134 | 0.843 | 1.036 |
| 1.938362667264917 | 1.137 | 0.845 | 1.036 |
| 1.941504259918506 | 1.14 | 0.846 | 1.037 |
| 1.944645852572096 | 1.142 | 0.848 | 1.038 |
| 1.947787445225686 | 1.145 | 0.849 | 1.038 |
| 1.950929037879276 | 1.148 | 0.851 | 1.039 |
| 1.954070630532866 | 1.15 | 0.852 | 1.039 |
| 1.957212223186455 | 1.153 | 0.854 | 1.04 |
| 1.960353815840045 | 1.156 | 0.855 | 1.04 |
| 1.963495408493635 | 1.159 | 0.857 | 1.041 |
| 1.966637001147225 | 1.161 | 0.858 | 1.041 |
| 1.969778593800815 | 1.164 | 0.86 | 1.042 |
| 1.972920186454405 | 1.167 | 0.862 | 1.042 |
| 1.976061779107994 | 1.169 | 0.863 | 1.042 |
| 1.979203371761584 | 1.172 | 0.865 | 1.043 |
| 1.982344964415174 | 1.174 | 0.867 | 1.043 |
| 1.985486557068764 | 1.177 | 0.868 | 1.043 |
| 1.988628149722354 | 1.18 | 0.87 | 1.044 |
| 1.991769742375943 | 1.182 | 0.872 | 1.044 |
| 1.994911335029533 | 1.185 | 0.873 | 1.044 |
| 1.998052927683123 | 1.188 | 0.875 | 1.045 |
| 2.001194520336712 | 1.19 | 0.877 | 1.045 |
| 2.004336112990302 | 1.193 | 0.879 | 1.045 |
| 2.007477705643892 | 1.195 | 0.881 | 1.045 |
| 2.010619298297482 | 1.198 | 0.883 | 1.045 |
| 2.013760890951071 | 1.201 | 0.884 | 1.046 |
| 2.016902483604661 | 1.203 | 0.886 | 1.046 |
| 2.02004407625825 | 1.206 | 0.888 | 1.046 |
| 2.02318566891184 | 1.208 | 0.89 | 1.046 |
| 2.02632726156543 | 1.211 | 0.892 | 1.046 |
| 2.029468854219019 | 1.213 | 0.894 | 1.046 |
| 2.032610446872609 | 1.216 | 0.896 | 1.046 |
| 2.035752039526198 | 1.218 | 0.898 | 1.047 |
| 2.038893632179788 | 1.221 | 0.9 | 1.047 |
| 2.042035224833378 | 1.223 | 0.902 | 1.047 |
| 2.045176817486967 | 1.226 | 0.904 | 1.047 |
| 2.048318410140557 | 1.228 | 0.906 | 1.047 |
| 2.051460002794146 | 1.231 | 0.908 | 1.047 |
| 2.054601595447736 | 1.233 | 0.911 | 1.047 |
| 2.057743188101325 | 1.236 | 0.913 | 1.047 |
| 2.060884780754915 | 1.238 | 0.915 | 1.047 |
| 2.064026373408505 | 1.241 | 0.917 | 1.047 |
| 2.067167966062094 | 1.243 | 0.919 | 1.047 |
| 2.070309558715684 | 1.245 | 0.921 | 1.047 |
| 2.073451151369273 | 1.248 | 0.924 | 1.047 |
| 2.076592744022863 | 1.25 | 0.926 | 1.047 |
| 2.079734336676452 | 1.253 | 0.928 | 1.047 |
| 2.082875929330042 | 1.255 | 0.93 | 1.047 |
| 2.086017521983632 | 1.257 | 0.933 | 1.047 |
| 2.089159114637221 | 1.26 | 0.935 | 1.047 |
| 2.092300707290811 | 1.262 | 0.937 | 1.047 |
| 2.095442299944401 | 1.264 | 0.94 | 1.047 |
| 2.09858389259799 | 1.267 | 0.942 | 1.047 |
| 2.10172548525158 | 1.269 | 0.944 | 1.047 |
| 2.104867077905169 | 1.272 | 0.947 | 1.047 |
| 2.108008670558759 | 1.274 | 0.949 | 1.047 |
| 2.111150263212349 | 1.276 | 0.952 | 1.047 |
| 2.114291855865938 | 1.278 | 0.954 | 1.047 |
| 2.117433448519528 | 1.281 | 0.957 | 1.047 |
| 2.120575041173117 | 1.283 | 0.959 | 1.047 |
| 2.123716633826707 | 1.285 | 0.962 | 1.047 |
| 2.126858226480297 | 1.288 | 0.964 | 1.047 |
| 2.129999819133886 | 1.29 | 0.967 | 1.047 |
| 2.133141411787476 | 1.292 | 0.969 | 1.047 |
| 2.136283004441065 | 1.294 | 0.972 | 1.047 |
| 2.139424597094655 | 1.297 | 0.974 | 1.047 |
| 2.142566189748245 | 1.299 | 0.977 | 1.048 |
| 2.145707782401834 | 1.301 | 0.98 | 1.048 |
| 2.148849375055424 | 1.303 | 0.982 | 1.048 |
| 2.151990967709013 | 1.305 | 0.985 | 1.048 |
| 2.155132560362603 | 1.308 | 0.988 | 1.048 |
| 2.158274153016193 | 1.31 | 0.99 | 1.048 |
| 2.161415745669782 | 1.312 | 0.993 | 1.048 |
| 2.164557338323372 | 1.314 | 0.996 | 1.048 |
| 2.167698930976961 | 1.316 | 0.998 | 1.048 |
| 2.170840523630551 | 1.318 | 1.001 | 1.049 |
| 2.173982116284141 | 1.321 | 1.004 | 1.049 |
| 2.17712370893773 | 1.323 | 1.006 | 1.049 |
| 2.18026530159132 | 1.325 | 1.009 | 1.049 |
| 2.183406894244909 | 1.327 | 1.012 | 1.049 |
| 2.186548486898499 | 1.329 | 1.015 | 1.05 |
| 2.189690079552089 | 1.331 | 1.018 | 1.05 |
| 2.192831672205678 | 1.333 | 1.02 | 1.05 |
| 2.195973264859268 | 1.335 | 1.023 | 1.05 |
| 2.199114857512857 | 1.337 | 1.026 | 1.051 |
| 2.202256450166447 | 1.339 | 1.029 | 1.051 |
| 2.205398042820036 | 1.341 | 1.032 | 1.051 |
| 2.208539635473626 | 1.343 | 1.035 | 1.052 |
| 2.211681228127216 | 1.345 | 1.038 | 1.052 |
| 2.214822820780805 | 1.347 | 1.04 | 1.052 |
| 2.217964413434395 | 1.349 | 1.043 | 1.053 |
| 2.221106006087984 | 1.351 | 1.046 | 1.053 |
| 2.224247598741574 | 1.353 | 1.049 | 1.054 |
| 2.227389191395164 | 1.355 | 1.052 | 1.054 |
| 2.230530784048753 | 1.357 | 1.055 | 1.055 |
| 2.233672376702343 | 1.359 | 1.058 | 1.055 |
| 2.236813969355933 | 1.361 | 1.061 | 1.056 |
| 2.239955562009522 | 1.363 | 1.064 | 1.056 |
| 2.243097154663112 | 1.365 | 1.067 | 1.057 |
| 2.246238747316701 | 1.367 | 1.07 | 1.057 |
| 2.249380339970291 | 1.369 | 1.073 | 1.058 |
| 2.252521932623881 | 1.371 | 1.076 | 1.059 |
| 2.25566352527747 | 1.373 | 1.079 | 1.059 |
| 2.25880511793106 | 1.375 | 1.082 | 1.06 |
| 2.261946710584649 | 1.377 | 1.085 | 1.061 |
| 2.265088303238239 | 1.378 | 1.088 | 1.061 |
| 2.268229895891829 | 1.38 | 1.091 | 1.062 |
| 2.271371488545418 | 1.382 | 1.094 | 1.063 |
| 2.274513081199008 | 1.384 | 1.097 | 1.064 |
| 2.277654673852597 | 1.386 | 1.1 | 1.065 |
| 2.280796266506186 | 1.388 | 1.103 | 1.065 |
| 2.283937859159776 | 1.389 | 1.106 | 1.066 |
| 2.287079451813366 | 1.391 | 1.109 | 1.067 |
| 2.290221044466955 | 1.393 | 1.113 | 1.068 |
| 2.293362637120545 | 1.395 | 1.116 | 1.069 |
| 2.296504229774135 | 1.396 | 1.119 | 1.07 |
| 2.299645822427724 | 1.398 | 1.122 | 1.071 |
| 2.302787415081314 | 1.4 | 1.125 | 1.072 |
| 2.305929007734904 | 1.402 | 1.128 | 1.073 |
| 2.309070600388493 | 1.403 | 1.131 | 1.075 |
| 2.312212193042083 | 1.405 | 1.134 | 1.076 |
| 2.315353785695672 | 1.407 | 1.137 | 1.077 |
| 2.318495378349262 | 1.409 | 1.14 | 1.078 |
| 2.321636971002852 | 1.41 | 1.144 | 1.079 |
| 2.324778563656441 | 1.412 | 1.147 | 1.081 |
| 2.327920156310031 | 1.414 | 1.15 | 1.082 |
| 2.33106174896362 | 1.415 | 1.153 | 1.083 |
| 2.33420334161721 | 1.417 | 1.156 | 1.084 |
| 2.3373449342708 | 1.418 | 1.159 | 1.086 |
| 2.340486526924389 | 1.42 | 1.162 | 1.087 |
| 2.343628119577979 | 1.422 | 1.166 | 1.089 |
| 2.346769712231568 | 1.423 | 1.169 | 1.09 |
| 2.349911304885158 | 1.425 | 1.172 | 1.092 |
| 2.353052897538748 | 1.427 | 1.175 | 1.093 |
| 2.356194490192337 | 1.428 | 1.178 | 1.095 |
| 2.359336082845927 | 1.43 | 1.181 | 1.096 |
| 2.362477675499516 | 1.431 | 1.184 | 1.098 |
| 2.365619268153106 | 1.433 | 1.188 | 1.1 |
| 2.368760860806696 | 1.434 | 1.191 | 1.101 |
| 2.371902453460285 | 1.436 | 1.194 | 1.103 |
| 2.375044046113875 | 1.437 | 1.197 | 1.105 |
| 2.378185638767464 | 1.439 | 1.2 | 1.106 |
| 2.381327231421054 | 1.44 | 1.203 | 1.108 |
| 2.384468824074644 | 1.442 | 1.206 | 1.11 |
| 2.387610416728233 | 1.443 | 1.209 | 1.112 |
| 2.390752009381823 | 1.445 | 1.213 | 1.114 |
| 2.393893602035412 | 1.446 | 1.216 | 1.116 |
| 2.397035194689002 | 1.448 | 1.219 | 1.118 |
| 2.400176787342591 | 1.449 | 1.222 | 1.12 |
| 2.403318379996181 | 1.451 | 1.225 | 1.122 |
| 2.406459972649771 | 1.452 | 1.228 | 1.124 |
| 2.40960156530336 | 1.453 | 1.231 | 1.126 |
| 2.41274315795695 | 1.455 | 1.234 | 1.128 |
| 2.41588475061054 | 1.456 | 1.238 | 1.13 |
| 2.419026343264129 | 1.458 | 1.241 | 1.132 |
| 2.422167935917719 | 1.459 | 1.244 | 1.134 |
| 2.425309528571308 | 1.46 | 1.247 | 1.136 |
| 2.428451121224898 | 1.462 | 1.25 | 1.139 |
| 2.431592713878488 | 1.463 | 1.253 | 1.141 |
| 2.434734306532077 | 1.464 | 1.256 | 1.143 |
| 2.437875899185667 | 1.466 | 1.259 | 1.145 |
| 2.441017491839256 | 1.467 | 1.262 | 1.148 |
| 2.444159084492846 | 1.468 | 1.265 | 1.15 |
| 2.447300677146435 | 1.47 | 1.268 | 1.152 |
| 2.450442269800025 | 1.471 | 1.271 | 1.155 |
| 2.453583862453615 | 1.472 | 1.274 | 1.157 |
| 2.456725455107204 | 1.473 | 1.277 | 1.16 |
| 2.459867047760794 | 1.475 | 1.28 | 1.162 |
| 2.463008640414384 | 1.476 | 1.283 | 1.165 |
| 2.466150233067973 | 1.477 | 1.286 | 1.167 |
| 2.469291825721563 | 1.478 | 1.289 | 1.17 |
| 2.472433418375152 | 1.479 | 1.292 | 1.172 |
| 2.475575011028742 | 1.481 | 1.295 | 1.175 |
| 2.478716603682332 | 1.482 | 1.298 | 1.178 |
| 2.481858196335921 | 1.483 | 1.301 | 1.18 |
| 2.48499978898951 | 1.484 | 1.304 | 1.183 |
| 2.4881413816431 | 1.485 | 1.307 | 1.186 |
| 2.49128297429669 | 1.487 | 1.31 | 1.188 |
| 2.49442456695028 | 1.488 | 1.313 | 1.191 |
| 2.497566159603869 | 1.489 | 1.316 | 1.194 |
| 2.500707752257458 | 1.49 | 1.319 | 1.196 |
| 2.503849344911048 | 1.491 | 1.322 | 1.199 |
| 2.506990937564638 | 1.492 | 1.324 | 1.202 |
| 2.510132530218228 | 1.493 | 1.327 | 1.205 |
| 2.513274122871817 | 1.494 | 1.33 | 1.208 |
| 2.516415715525407 | 1.495 | 1.333 | 1.211 |
| 2.519557308178996 | 1.497 | 1.336 | 1.213 |
| 2.522698900832586 | 1.498 | 1.339 | 1.216 |
| 2.525840493486176 | 1.499 | 1.341 | 1.219 |
| 2.528982086139765 | 1.5 | 1.344 | 1.222 |
| 2.532123678793355 | 1.501 | 1.347 | 1.225 |
| 2.535265271446944 | 1.502 | 1.35 | 1.228 |
| 2.538406864100534 | 1.503 | 1.352 | 1.231 |
| 2.541548456754124 | 1.504 | 1.355 | 1.234 |
| 2.544690049407713 | 1.505 | 1.358 | 1.237 |
| 2.547831642061302 | 1.506 | 1.361 | 1.24 |
| 2.550973234714892 | 1.507 | 1.363 | 1.243 |
| 2.554114827368482 | 1.508 | 1.366 | 1.246 |
| 2.557256420022072 | 1.509 | 1.369 | 1.249 |
| 2.560398012675661 | 1.51 | 1.371 | 1.252 |
| 2.563539605329251 | 1.511 | 1.374 | 1.255 |
| 2.56668119798284 | 1.512 | 1.377 | 1.258 |
| 2.56982279063643 | 1.512 | 1.379 | 1.261 |
| 2.57296438329002 | 1.513 | 1.382 | 1.264 |
| 2.576105975943609 | 1.514 | 1.384 | 1.267 |
| 2.579247568597199 | 1.515 | 1.387 | 1.27 |
| 2.582389161250788 | 1.516 | 1.389 | 1.274 |
| 2.585530753904377 | 1.517 | 1.392 | 1.277 |
| 2.588672346557967 | 1.518 | 1.395 | 1.28 |
| 2.591813939211557 | 1.519 | 1.397 | 1.283 |
| 2.594955531865147 | 1.52 | 1.4 | 1.286 |
| 2.598097124518736 | 1.52 | 1.402 | 1.289 |
| 2.601238717172326 | 1.521 | 1.404 | 1.292 |
| 2.604380309825915 | 1.522 | 1.407 | 1.295 |
| 2.607521902479505 | 1.523 | 1.409 | 1.299 |
| 2.610663495133095 | 1.524 | 1.412 | 1.302 |
| 2.613805087786684 | 1.524 | 1.414 | 1.305 |
| 2.616946680440274 | 1.525 | 1.416 | 1.308 |
| 2.620088273093863 | 1.526 | 1.419 | 1.311 |
| 2.623229865747452 | 1.527 | 1.421 | 1.314 |
| 2.626371458401042 | 1.528 | 1.423 | 1.317 |
| 2.629513051054632 | 1.528 | 1.426 | 1.321 |
| 2.632654643708222 | 1.529 | 1.428 | 1.324 |
| 2.635796236361811 | 1.53 | 1.43 | 1.327 |
| 2.638937829015401 | 1.531 | 1.433 | 1.33 |
| 2.642079421668991 | 1.531 | 1.435 | 1.333 |
| 2.64522101432258 | 1.532 | 1.437 | 1.336 |
| 2.64836260697617 | 1.533 | 1.439 | 1.339 |
| 2.651504199629759 | 1.533 | 1.441 | 1.342 |
| 2.654645792283349 | 1.534 | 1.444 | 1.346 |
| 2.657787384936938 | 1.535 | 1.446 | 1.349 |
| 2.660928977590528 | 1.535 | 1.448 | 1.352 |
| 2.664070570244118 | 1.536 | 1.45 | 1.355 |
| 2.667212162897707 | 1.537 | 1.452 | 1.358 |
| 2.670353755551297 | 1.537 | 1.454 | 1.361 |
| 2.673495348204887 | 1.538 | 1.456 | 1.364 |
| 2.676636940858476 | 1.539 | 1.458 | 1.367 |
| 2.679778533512066 | 1.539 | 1.46 | 1.37 |
| 2.682920126165655 | 1.54 | 1.462 | 1.373 |
| 2.686061718819245 | 1.541 | 1.464 | 1.376 |
| 2.689203311472835 | 1.541 | 1.466 | 1.379 |
| 2.692344904126424 | 1.542 | 1.468 | 1.382 |
| 2.695486496780014 | 1.542 | 1.47 | 1.385 |
| 2.698628089433603 | 1.543 | 1.472 | 1.388 |
| 2.701769682087193 | 1.544 | 1.474 | 1.391 |
| 2.704911274740782 | 1.544 | 1.476 | 1.394 |
| 2.708052867394372 | 1.545 | 1.477 | 1.397 |
| 2.711194460047962 | 1.545 | 1.479 | 1.4 |
| 2.714336052701551 | 1.546 | 1.481 | 1.403 |
| 2.717477645355141 | 1.546 | 1.483 | 1.406 |
| 2.720619238008731 | 1.547 | 1.485 | 1.408 |
| 2.72376083066232 | 1.547 | 1.486 | 1.411 |
| 2.72690242331591 | 1.548 | 1.488 | 1.414 |
| 2.730044015969499 | 1.548 | 1.49 | 1.417 |
| 2.733185608623089 | 1.549 | 1.491 | 1.42 |
| 2.736327201276678 | 1.549 | 1.493 | 1.422 |
| 2.739468793930268 | 1.55 | 1.495 | 1.425 |
| 2.742610386583858 | 1.55 | 1.496 | 1.428 |
| 2.745751979237447 | 1.551 | 1.498 | 1.431 |
| 2.748893571891036 | 1.551 | 1.499 | 1.433 |
| 2.752035164544627 | 1.552 | 1.501 | 1.436 |
| 2.755176757198216 | 1.552 | 1.503 | 1.439 |
| 2.758318349851806 | 1.553 | 1.504 | 1.441 |
| 2.761459942505395 | 1.553 | 1.506 | 1.444 |
| 2.764601535158985 | 1.553 | 1.507 | 1.447 |
| 2.767743127812574 | 1.554 | 1.509 | 1.449 |
| 2.770884720466164 | 1.554 | 1.51 | 1.452 |
| 2.774026313119754 | 1.555 | 1.511 | 1.454 |
| 2.777167905773343 | 1.555 | 1.513 | 1.457 |
| 2.780309498426932 | 1.555 | 1.514 | 1.459 |
| 2.783451091080522 | 1.556 | 1.516 | 1.462 |
| 2.786592683734112 | 1.556 | 1.517 | 1.464 |
| 2.789734276387701 | 1.557 | 1.518 | 1.466 |
| 2.792875869041291 | 1.557 | 1.52 | 1.469 |
| 2.796017461694881 | 1.557 | 1.521 | 1.471 |
| 2.79915905434847 | 1.558 | 1.522 | 1.473 |
| 2.80230064700206 | 1.558 | 1.523 | 1.476 |
| 2.80544223965565 | 1.558 | 1.525 | 1.478 |
| 2.808583832309239 | 1.559 | 1.526 | 1.48 |
| 2.811725424962829 | 1.559 | 1.527 | 1.482 |
| 2.814867017616419 | 1.559 | 1.528 | 1.485 |
| 2.818008610270008 | 1.56 | 1.529 | 1.487 |
| 2.821150202923598 | 1.56 | 1.53 | 1.489 |
| 2.824291795577187 | 1.56 | 1.532 | 1.491 |
| 2.827433388230777 | 1.561 | 1.533 | 1.493 |
| 2.830574980884366 | 1.561 | 1.534 | 1.495 |
| 2.833716573537956 | 1.561 | 1.535 | 1.497 |
| 2.836858166191546 | 1.562 | 1.536 | 1.499 |
| 2.839999758845135 | 1.562 | 1.537 | 1.501 |
| 2.843141351498725 | 1.562 | 1.538 | 1.503 |
| 2.846282944152314 | 1.562 | 1.539 | 1.505 |
| 2.849424536805904 | 1.563 | 1.54 | 1.507 |
| 2.852566129459494 | 1.563 | 1.541 | 1.509 |
| 2.855707722113083 | 1.563 | 1.542 | 1.51 |
| 2.858849314766673 | 1.563 | 1.543 | 1.512 |
| 2.861990907420262 | 1.564 | 1.543 | 1.514 |
| 2.865132500073852 | 1.564 | 1.544 | 1.516 |
| 2.868274092727442 | 1.564 | 1.545 | 1.517 |
| 2.871415685381031 | 1.564 | 1.546 | 1.519 |
| 2.874557278034621 | 1.565 | 1.547 | 1.521 |
| 2.87769887068821 | 1.565 | 1.548 | 1.522 |
| 2.8808404633418 | 1.565 | 1.548 | 1.524 |
| 2.88398205599539 | 1.565 | 1.549 | 1.525 |
| 2.88712364864898 | 1.565 | 1.55 | 1.527 |
| 2.890265241302569 | 1.566 | 1.551 | 1.528 |
| 2.893406833956158 | 1.566 | 1.551 | 1.53 |
| 2.896548426609748 | 1.566 | 1.552 | 1.531 |
| 2.899690019263338 | 1.566 | 1.553 | 1.533 |
| 2.902831611916927 | 1.566 | 1.553 | 1.534 |
| 2.905973204570517 | 1.566 | 1.554 | 1.535 |
| 2.909114797224106 | 1.567 | 1.555 | 1.537 |
| 2.912256389877696 | 1.567 | 1.555 | 1.538 |
| 2.915397982531286 | 1.567 | 1.556 | 1.539 |
| 2.918539575184875 | 1.567 | 1.557 | 1.54 |
| 2.921681167838465 | 1.567 | 1.557 | 1.542 |
| 2.924822760492054 | 1.567 | 1.558 | 1.543 |
| 2.927964353145644 | 1.568 | 1.558 | 1.544 |
| 2.931105945799234 | 1.568 | 1.559 | 1.545 |
| 2.934247538452823 | 1.568 | 1.559 | 1.546 |
| 2.937389131106413 | 1.568 | 1.56 | 1.547 |
| 2.940530723760002 | 1.568 | 1.56 | 1.548 |
| 2.943672316413592 | 1.568 | 1.561 | 1.549 |
| 2.946813909067182 | 1.568 | 1.561 | 1.55 |
| 2.949955501720771 | 1.568 | 1.562 | 1.551 |
| 2.953097094374361 | 1.569 | 1.562 | 1.552 |
| 2.95623868702795 | 1.569 | 1.563 | 1.553 |
| 2.95938027968154 | 1.569 | 1.563 | 1.554 |
| 2.96252187233513 | 1.569 | 1.563 | 1.555 |
| 2.965663464988719 | 1.569 | 1.564 | 1.555 |
| 2.968805057642309 | 1.569 | 1.564 | 1.556 |
| 2.971946650295898 | 1.569 | 1.564 | 1.557 |
| 2.975088242949488 | 1.569 | 1.565 | 1.558 |
| 2.978229835603078 | 1.569 | 1.565 | 1.558 |
| 2.981371428256667 | 1.569 | 1.565 | 1.559 |
| 2.984513020910257 | 1.57 | 1.566 | 1.56 |
| 2.987654613563846 | 1.57 | 1.566 | 1.56 |
| 2.990796206217436 | 1.57 | 1.566 | 1.561 |
| 2.993937798871025 | 1.57 | 1.567 | 1.562 |
| 2.997079391524615 | 1.57 | 1.567 | 1.562 |
| 3.000220984178205 | 1.57 | 1.567 | 1.563 |
| 3.003362576831794 | 1.57 | 1.567 | 1.563 |
| 3.006504169485384 | 1.57 | 1.568 | 1.564 |
| 3.009645762138974 | 1.57 | 1.568 | 1.564 |
| 3.012787354792563 | 1.57 | 1.568 | 1.565 |
| 3.015928947446153 | 1.57 | 1.568 | 1.565 |
| 3.019070540099742 | 1.57 | 1.568 | 1.565 |
| 3.022212132753332 | 1.57 | 1.569 | 1.566 |
| 3.025353725406922 | 1.57 | 1.569 | 1.566 |
| 3.028495318060511 | 1.57 | 1.569 | 1.567 |
| 3.031636910714101 | 1.57 | 1.569 | 1.567 |
| 3.03477850336769 | 1.57 | 1.569 | 1.567 |
| 3.03792009602128 | 1.57 | 1.569 | 1.568 |
| 3.04106168867487 | 1.57 | 1.569 | 1.568 |
| 3.04420328132846 | 1.57 | 1.57 | 1.568 |
| 3.047344873982049 | 1.571 | 1.57 | 1.568 |
| 3.050486466635638 | 1.571 | 1.57 | 1.569 |
| 3.053628059289228 | 1.571 | 1.57 | 1.569 |
| 3.056769651942818 | 1.571 | 1.57 | 1.569 |
| 3.059911244596407 | 1.571 | 1.57 | 1.569 |
| 3.063052837249997 | 1.571 | 1.57 | 1.569 |
| 3.066194429903586 | 1.571 | 1.57 | 1.57 |
| 3.069336022557176 | 1.571 | 1.57 | 1.57 |
| 3.072477615210766 | 1.571 | 1.57 | 1.57 |
| 3.075619207864355 | 1.571 | 1.57 | 1.57 |
| 3.078760800517945 | 1.571 | 1.57 | 1.57 |
| 3.081902393171534 | 1.571 | 1.571 | 1.57 |
| 3.085043985825124 | 1.571 | 1.571 | 1.57 |
| 3.088185578478713 | 1.571 | 1.571 | 1.57 |
| 3.091327171132303 | 1.571 | 1.571 | 1.57 |
| 3.094468763785893 | 1.571 | 1.571 | 1.57 |
| 3.097610356439482 | 1.571 | 1.571 | 1.571 |
| 3.100751949093072 | 1.571 | 1.571 | 1.571 |
| 3.103893541746661 | 1.571 | 1.571 | 1.571 |
| 3.107035134400251 | 1.571 | 1.571 | 1.571 |
| 3.110176727053841 | 1.571 | 1.571 | 1.571 |
| 3.11331831970743 | 1.571 | 1.571 | 1.571 |
| 3.11645991236102 | 1.571 | 1.571 | 1.571 |
| 3.11960150501461 | 1.571 | 1.571 | 1.571 |
| 3.122743097668199 | 1.571 | 1.571 | 1.571 |
| 3.125884690321789 | 1.571 | 1.571 | 1.571 |
| 3.129026282975378 | 1.571 | 1.571 | 1.571 |
| 3.132167875628968 | 1.571 | 1.571 | 1.571 |
| 3.135309468282557 | 1.571 | 1.571 | 1.571 |
| 3.138451060936147 | 1.571 | 1.571 | 1.571 |
| 3.141592653589737 | 1.571 | 1.571 | 1.571 |
| 3.144734246243326 | 1.571 | 1.571 | 1.571 |
| 3.147875838896916 | 1.571 | 1.571 | 1.571 |
| 3.151017431550505 | 1.571 | 1.571 | 1.571 |
| 3.154159024204095 | 1.571 | 1.571 | 1.571 |
| 3.157300616857685 | 1.571 | 1.571 | 1.571 |
| 3.160442209511274 | 1.571 | 1.571 | 1.571 |
| 3.163583802164864 | 1.571 | 1.571 | 1.571 |
| 3.166725394818453 | 1.571 | 1.571 | 1.571 |
| 3.169866987472043 | 1.571 | 1.571 | 1.571 |
| 3.173008580125633 | 1.571 | 1.571 | 1.571 |
| 3.176150172779222 | 1.571 | 1.571 | 1.571 |
| 3.179291765432812 | 1.571 | 1.571 | 1.571 |
| 3.182433358086401 | 1.571 | 1.571 | 1.571 |
| 3.185574950739991 | 1.571 | 1.571 | 1.571 |
| 3.188716543393581 | 1.571 | 1.571 | 1.571 |
| 3.19185813604717 | 1.571 | 1.571 | 1.571 |
| 3.19499972870076 | 1.571 | 1.571 | 1.571 |
| 3.198141321354349 | 1.571 | 1.571 | 1.571 |
| 3.20128291400794 | 1.571 | 1.571 | 1.571 |
| 3.204424506661528 | 1.571 | 1.571 | 1.572 |
| 3.207566099315118 | 1.571 | 1.571 | 1.572 |
| 3.210707691968708 | 1.571 | 1.571 | 1.572 |
| 3.213849284622297 | 1.571 | 1.571 | 1.572 |
| 3.216990877275887 | 1.571 | 1.571 | 1.572 |
| 3.220132469929476 | 1.571 | 1.571 | 1.572 |
| 3.223274062583066 | 1.571 | 1.572 | 1.572 |
| 3.226415655236656 | 1.571 | 1.572 | 1.573 |
| 3.229557247890245 | 1.571 | 1.572 | 1.573 |
| 3.232698840543835 | 1.571 | 1.572 | 1.573 |
| 3.235840433197425 | 1.571 | 1.572 | 1.573 |
| 3.238982025851014 | 1.571 | 1.572 | 1.574 |
| 3.242123618504604 | 1.571 | 1.572 | 1.574 |
| 3.245265211158193 | 1.571 | 1.572 | 1.574 |
| 3.248406803811783 | 1.571 | 1.572 | 1.574 |
| 3.251548396465373 | 1.571 | 1.573 | 1.575 |
| 3.254689989118962 | 1.571 | 1.573 | 1.575 |
| 3.257831581772551 | 1.571 | 1.573 | 1.575 |
| 3.260973174426141 | 1.571 | 1.573 | 1.576 |
| 3.26411476707973 | 1.571 | 1.573 | 1.576 |
| 3.267256359733321 | 1.571 | 1.573 | 1.577 |
| 3.27039795238691 | 1.572 | 1.574 | 1.577 |
| 3.2735395450405 | 1.572 | 1.574 | 1.577 |
| 3.276681137694089 | 1.572 | 1.574 | 1.578 |
| 3.279822730347679 | 1.572 | 1.574 | 1.578 |
| 3.282964323001269 | 1.572 | 1.575 | 1.579 |
| 3.286105915654858 | 1.572 | 1.575 | 1.58 |
| 3.289247508308448 | 1.572 | 1.575 | 1.58 |
| 3.292389100962037 | 1.572 | 1.575 | 1.581 |
| 3.295530693615627 | 1.572 | 1.576 | 1.581 |
| 3.298672286269217 | 1.572 | 1.576 | 1.582 |
| 3.301813878922806 | 1.572 | 1.576 | 1.583 |
| 3.304955471576396 | 1.572 | 1.576 | 1.583 |
| 3.308097064229985 | 1.572 | 1.577 | 1.584 |
| 3.311238656883575 | 1.572 | 1.577 | 1.585 |
| 3.314380249537165 | 1.573 | 1.578 | 1.585 |
| 3.317521842190754 | 1.573 | 1.578 | 1.586 |
| 3.320663434844344 | 1.573 | 1.578 | 1.587 |
| 3.323805027497933 | 1.573 | 1.579 | 1.588 |
| 3.326946620151523 | 1.573 | 1.579 | 1.589 |
| 3.330088212805113 | 1.573 | 1.579 | 1.59 |
| 3.333229805458702 | 1.573 | 1.58 | 1.591 |
| 3.336371398112292 | 1.573 | 1.58 | 1.591 |
| 3.339512990765881 | 1.573 | 1.581 | 1.592 |
| 3.342654583419471 | 1.573 | 1.581 | 1.593 |
| 3.345796176073061 | 1.574 | 1.582 | 1.594 |
| 3.34893776872665 | 1.574 | 1.582 | 1.596 |
| 3.35207936138024 | 1.574 | 1.583 | 1.597 |
| 3.355220954033829 | 1.574 | 1.583 | 1.598 |
| 3.358362546687419 | 1.574 | 1.584 | 1.599 |
| 3.361504139341009 | 1.574 | 1.584 | 1.6 |
| 3.364645731994598 | 1.574 | 1.585 | 1.601 |
| 3.367787324648188 | 1.575 | 1.586 | 1.602 |
| 3.370928917301777 | 1.575 | 1.586 | 1.604 |
| 3.374070509955367 | 1.575 | 1.587 | 1.605 |
| 3.377212102608956 | 1.575 | 1.587 | 1.606 |
| 3.380353695262546 | 1.575 | 1.588 | 1.608 |
| 3.383495287916136 | 1.575 | 1.589 | 1.609 |
| 3.386636880569725 | 1.576 | 1.589 | 1.61 |
| 3.389778473223315 | 1.576 | 1.59 | 1.612 |
| 3.392920065876904 | 1.576 | 1.591 | 1.613 |
| 3.396061658530494 | 1.576 | 1.592 | 1.615 |
| 3.399203251184084 | 1.576 | 1.592 | 1.616 |
| 3.402344843837673 | 1.577 | 1.593 | 1.618 |
| 3.405486436491263 | 1.577 | 1.594 | 1.619 |
| 3.408628029144852 | 1.577 | 1.595 | 1.621 |
| 3.411769621798442 | 1.577 | 1.596 | 1.623 |
| 3.414911214452032 | 1.578 | 1.596 | 1.624 |
| 3.418052807105621 | 1.578 | 1.597 | 1.626 |
| 3.421194399759211 | 1.578 | 1.598 | 1.628 |
| 3.4243359924128 | 1.578 | 1.599 | 1.629 |
| 3.42747758506639 | 1.578 | 1.6 | 1.631 |
| 3.43061917771998 | 1.579 | 1.601 | 1.633 |
| 3.433760770373569 | 1.579 | 1.602 | 1.635 |
| 3.436902363027159 | 1.579 | 1.603 | 1.637 |
| 3.440043955680748 | 1.58 | 1.604 | 1.639 |
| 3.443185548334338 | 1.58 | 1.605 | 1.641 |
| 3.446327140987927 | 1.58 | 1.606 | 1.643 |
| 3.449468733641517 | 1.58 | 1.607 | 1.645 |
| 3.452610326295107 | 1.581 | 1.608 | 1.647 |
| 3.455751918948696 | 1.581 | 1.609 | 1.649 |
| 3.458893511602286 | 1.581 | 1.61 | 1.651 |
| 3.462035104255876 | 1.582 | 1.611 | 1.653 |
| 3.465176696909465 | 1.582 | 1.612 | 1.655 |
| 3.468318289563055 | 1.582 | 1.613 | 1.657 |
| 3.471459882216644 | 1.583 | 1.615 | 1.659 |
| 3.474601474870234 | 1.583 | 1.616 | 1.661 |
| 3.477743067523824 | 1.583 | 1.617 | 1.664 |
| 3.480884660177413 | 1.584 | 1.618 | 1.666 |
| 3.484026252831002 | 1.584 | 1.62 | 1.668 |
| 3.487167845484592 | 1.584 | 1.621 | 1.671 |
| 3.490309438138182 | 1.585 | 1.622 | 1.673 |
| 3.493451030791772 | 1.585 | 1.623 | 1.675 |
| 3.496592623445361 | 1.585 | 1.625 | 1.678 |
| 3.499734216098951 | 1.586 | 1.626 | 1.68 |
| 3.50287580875254 | 1.586 | 1.627 | 1.683 |
| 3.50601740140613 | 1.587 | 1.629 | 1.685 |
| 3.50915899405972 | 1.587 | 1.63 | 1.687 |
| 3.512300586713309 | 1.587 | 1.632 | 1.69 |
| 3.515442179366899 | 1.588 | 1.633 | 1.693 |
| 3.518583772020488 | 1.588 | 1.635 | 1.695 |
| 3.521725364674078 | 1.589 | 1.636 | 1.698 |
| 3.524866957327668 | 1.589 | 1.638 | 1.7 |
| 3.528008549981257 | 1.589 | 1.639 | 1.703 |
| 3.531150142634847 | 1.59 | 1.641 | 1.706 |
| 3.534291735288436 | 1.59 | 1.642 | 1.708 |
| 3.537433327942026 | 1.591 | 1.644 | 1.711 |
| 3.540574920595616 | 1.591 | 1.645 | 1.714 |
| 3.543716513249205 | 1.592 | 1.647 | 1.716 |
| 3.546858105902795 | 1.592 | 1.649 | 1.719 |
| 3.549999698556384 | 1.593 | 1.65 | 1.722 |
| 3.553141291209974 | 1.593 | 1.652 | 1.725 |
| 3.556282883863564 | 1.594 | 1.654 | 1.727 |
| 3.559424476517153 | 1.594 | 1.655 | 1.73 |
| 3.562566069170743 | 1.595 | 1.657 | 1.733 |
| 3.565707661824332 | 1.595 | 1.659 | 1.736 |
| 3.568849254477922 | 1.596 | 1.661 | 1.739 |
| 3.571990847131511 | 1.596 | 1.662 | 1.742 |
| 3.575132439785101 | 1.597 | 1.664 | 1.745 |
| 3.578274032438691 | 1.598 | 1.666 | 1.748 |
| 3.58141562509228 | 1.598 | 1.668 | 1.751 |
| 3.58455721774587 | 1.599 | 1.67 | 1.754 |
| 3.58769881039946 | 1.599 | 1.672 | 1.756 |
| 3.590840403053049 | 1.6 | 1.674 | 1.759 |
| 3.593981995706639 | 1.6 | 1.676 | 1.762 |
| 3.597123588360228 | 1.601 | 1.677 | 1.765 |
| 3.600265181013818 | 1.602 | 1.679 | 1.768 |
| 3.603406773667407 | 1.602 | 1.681 | 1.772 |
| 3.606548366320997 | 1.603 | 1.683 | 1.775 |
| 3.609689958974587 | 1.604 | 1.685 | 1.778 |
| 3.612831551628176 | 1.604 | 1.688 | 1.781 |
| 3.615973144281766 | 1.605 | 1.69 | 1.784 |
| 3.619114736935355 | 1.605 | 1.692 | 1.787 |
| 3.622256329588945 | 1.606 | 1.694 | 1.79 |
| 3.625397922242534 | 1.607 | 1.696 | 1.793 |
| 3.628539514896124 | 1.607 | 1.698 | 1.796 |
| 3.631681107549714 | 1.608 | 1.7 | 1.799 |
| 3.634822700203303 | 1.609 | 1.702 | 1.802 |
| 3.637964292856893 | 1.61 | 1.705 | 1.805 |
| 3.641105885510483 | 1.61 | 1.707 | 1.809 |
| 3.644247478164072 | 1.611 | 1.709 | 1.812 |
| 3.647389070817662 | 1.612 | 1.711 | 1.815 |
| 3.650530663471251 | 1.613 | 1.714 | 1.818 |
| 3.653672256124841 | 1.613 | 1.716 | 1.821 |
| 3.656813848778431 | 1.614 | 1.718 | 1.824 |
| 3.65995544143202 | 1.615 | 1.72 | 1.827 |
| 3.66309703408561 | 1.616 | 1.723 | 1.831 |
| 3.666238626739199 | 1.616 | 1.725 | 1.834 |
| 3.66938021939279 | 1.617 | 1.727 | 1.837 |
| 3.672521812046378 | 1.618 | 1.73 | 1.84 |
| 3.675663404699968 | 1.619 | 1.732 | 1.843 |
| 3.678804997353558 | 1.62 | 1.735 | 1.846 |
| 3.681946590007147 | 1.62 | 1.737 | 1.849 |
| 3.685088182660737 | 1.621 | 1.74 | 1.852 |
| 3.688229775314326 | 1.622 | 1.742 | 1.856 |
| 3.691371367967916 | 1.623 | 1.745 | 1.859 |
| 3.694512960621506 | 1.624 | 1.747 | 1.862 |
| 3.697654553275095 | 1.625 | 1.75 | 1.865 |
| 3.700796145928685 | 1.626 | 1.752 | 1.868 |
| 3.703937738582274 | 1.626 | 1.755 | 1.871 |
| 3.707079331235864 | 1.627 | 1.757 | 1.874 |
| 3.710220923889454 | 1.628 | 1.76 | 1.877 |
| 3.713362516543043 | 1.629 | 1.762 | 1.88 |
| 3.716504109196633 | 1.63 | 1.765 | 1.884 |
| 3.719645701850223 | 1.631 | 1.768 | 1.887 |
| 3.722787294503812 | 1.632 | 1.77 | 1.89 |
| 3.725928887157402 | 1.633 | 1.773 | 1.893 |
| 3.729070479810991 | 1.634 | 1.776 | 1.896 |
| 3.732212072464581 | 1.635 | 1.778 | 1.899 |
| 3.735353665118171 | 1.636 | 1.781 | 1.902 |
| 3.73849525777176 | 1.637 | 1.784 | 1.905 |
| 3.74163685042535 | 1.638 | 1.786 | 1.908 |
| 3.744778443078939 | 1.639 | 1.789 | 1.911 |
| 3.747920035732529 | 1.64 | 1.792 | 1.914 |
| 3.751061628386119 | 1.641 | 1.795 | 1.917 |
| 3.754203221039708 | 1.642 | 1.797 | 1.92 |
| 3.757344813693298 | 1.643 | 1.8 | 1.922 |
| 3.760486406346887 | 1.644 | 1.803 | 1.925 |
| 3.763627999000477 | 1.645 | 1.806 | 1.928 |
| 3.766769591654067 | 1.646 | 1.809 | 1.931 |
| 3.769911184307656 | 1.647 | 1.811 | 1.934 |
| 3.773052776961246 | 1.648 | 1.814 | 1.937 |
| 3.776194369614835 | 1.649 | 1.817 | 1.94 |
| 3.779335962268425 | 1.65 | 1.82 | 1.942 |
| 3.782477554922014 | 1.652 | 1.823 | 1.945 |
| 3.785619147575604 | 1.653 | 1.826 | 1.948 |
| 3.788760740229193 | 1.654 | 1.829 | 1.951 |
| 3.791902332882783 | 1.655 | 1.832 | 1.953 |
| 3.795043925536373 | 1.656 | 1.835 | 1.956 |
| 3.798185518189962 | 1.657 | 1.838 | 1.959 |
| 3.801327110843552 | 1.659 | 1.84 | 1.961 |
| 3.804468703497142 | 1.66 | 1.843 | 1.964 |
| 3.807610296150731 | 1.661 | 1.846 | 1.967 |
| 3.810751888804321 | 1.662 | 1.849 | 1.969 |
| 3.813893481457911 | 1.663 | 1.852 | 1.972 |
| 3.8170350741115 | 1.665 | 1.855 | 1.974 |
| 3.82017666676509 | 1.666 | 1.858 | 1.977 |
| 3.823318259418679 | 1.667 | 1.861 | 1.979 |
| 3.826459852072269 | 1.668 | 1.864 | 1.982 |
| 3.829601444725859 | 1.67 | 1.867 | 1.984 |
| 3.832743037379448 | 1.671 | 1.87 | 1.987 |
| 3.835884630033038 | 1.672 | 1.873 | 1.989 |
| 3.839026222686627 | 1.673 | 1.876 | 1.992 |
| 3.842167815340217 | 1.675 | 1.879 | 1.994 |
| 3.845309407993807 | 1.676 | 1.883 | 1.996 |
| 3.848451000647396 | 1.677 | 1.886 | 1.998 |
| 3.851592593300986 | 1.679 | 1.889 | 2.001 |
| 3.854734185954575 | 1.68 | 1.892 | 2.003 |
| 3.857875778608165 | 1.681 | 1.895 | 2.005 |
| 3.861017371261755 | 1.683 | 1.898 | 2.007 |
| 3.864158963915344 | 1.684 | 1.901 | 2.01 |
| 3.867300556568933 | 1.685 | 1.904 | 2.012 |
| 3.870442149222523 | 1.687 | 1.907 | 2.014 |
| 3.873583741876112 | 1.688 | 1.91 | 2.016 |
| 3.876725334529703 | 1.69 | 1.913 | 2.018 |
| 3.879866927183292 | 1.691 | 1.917 | 2.02 |
| 3.883008519836882 | 1.692 | 1.92 | 2.022 |
| 3.886150112490471 | 1.694 | 1.923 | 2.024 |
| 3.889291705144061 | 1.695 | 1.926 | 2.026 |
| 3.892433297797651 | 1.697 | 1.929 | 2.028 |
| 3.89557489045124 | 1.698 | 1.932 | 2.03 |
| 3.89871648310483 | 1.7 | 1.935 | 2.031 |
| 3.901858075758419 | 1.701 | 1.938 | 2.033 |
| 3.904999668412009 | 1.703 | 1.942 | 2.035 |
| 3.908141261065598 | 1.704 | 1.945 | 2.037 |
| 3.911282853719188 | 1.706 | 1.948 | 2.039 |
| 3.914424446372778 | 1.707 | 1.951 | 2.04 |
| 3.917566039026367 | 1.709 | 1.954 | 2.042 |
| 3.920707631679957 | 1.71 | 1.957 | 2.044 |
| 3.923849224333547 | 1.712 | 1.96 | 2.045 |
| 3.926990816987136 | 1.713 | 1.963 | 2.047 |
| 3.930132409640726 | 1.715 | 1.967 | 2.048 |
| 3.933274002294315 | 1.717 | 1.97 | 2.05 |
| 3.936415594947905 | 1.718 | 1.973 | 2.051 |
| 3.939557187601495 | 1.72 | 1.976 | 2.053 |
| 3.942698780255084 | 1.721 | 1.979 | 2.054 |
| 3.945840372908674 | 1.723 | 1.982 | 2.056 |
| 3.948981965562263 | 1.725 | 1.985 | 2.057 |
| 3.952123558215853 | 1.726 | 1.989 | 2.058 |
| 3.955265150869442 | 1.728 | 1.992 | 2.06 |
| 3.958406743523032 | 1.73 | 1.995 | 2.061 |
| 3.961548336176622 | 1.731 | 1.998 | 2.062 |
| 3.964689928830211 | 1.733 | 2.001 | 2.064 |
| 3.967831521483801 | 1.735 | 2.004 | 2.065 |
| 3.97097311413739 | 1.736 | 2.007 | 2.066 |
| 3.97411470679098 | 1.738 | 2.01 | 2.067 |
| 3.97725629944457 | 1.74 | 2.014 | 2.068 |
| 3.98039789209816 | 1.742 | 2.017 | 2.069 |
| 3.983539484751749 | 1.743 | 2.02 | 2.07 |
| 3.986681077405338 | 1.745 | 2.023 | 2.071 |
| 3.989822670058928 | 1.747 | 2.026 | 2.072 |
| 3.992964262712517 | 1.749 | 2.029 | 2.073 |
| 3.996105855366107 | 1.75 | 2.032 | 2.074 |
| 3.999247448019697 | 1.752 | 2.035 | 2.075 |
| 4.002389040673287 | 1.754 | 2.038 | 2.076 |
| 4.005530633326877 | 1.756 | 2.041 | 2.077 |
| 4.008672225980466 | 1.758 | 2.044 | 2.078 |
| 4.011813818634056 | 1.759 | 2.048 | 2.079 |
| 4.014955411287645 | 1.761 | 2.051 | 2.079 |
| 4.018097003941234 | 1.763 | 2.054 | 2.08 |
| 4.021238596594824 | 1.765 | 2.057 | 2.081 |
| 4.024380189248414 | 1.767 | 2.06 | 2.082 |
| 4.027521781902004 | 1.769 | 2.063 | 2.082 |
| 4.030663374555593 | 1.771 | 2.066 | 2.083 |
| 4.033804967209183 | 1.773 | 2.069 | 2.084 |
| 4.036946559862773 | 1.774 | 2.072 | 2.084 |
| 4.040088152516362 | 1.776 | 2.075 | 2.085 |
| 4.043229745169951 | 1.778 | 2.078 | 2.085 |
| 4.046371337823541 | 1.78 | 2.081 | 2.086 |
| 4.049512930477131 | 1.782 | 2.084 | 2.087 |
| 4.05265452313072 | 1.784 | 2.087 | 2.087 |
| 4.05579611578431 | 1.786 | 2.089 | 2.088 |
| 4.0589377084379 | 1.788 | 2.092 | 2.088 |
| 4.062079301091489 | 1.79 | 2.095 | 2.088 |
| 4.065220893745079 | 1.792 | 2.098 | 2.089 |
| 4.068362486398668 | 1.794 | 2.101 | 2.089 |
| 4.071504079052258 | 1.796 | 2.104 | 2.09 |
| 4.074645671705848 | 1.798 | 2.107 | 2.09 |
| 4.077787264359437 | 1.8 | 2.11 | 2.09 |
| 4.080928857013027 | 1.802 | 2.113 | 2.091 |
| 4.084070449666616 | 1.804 | 2.116 | 2.091 |
| 4.087212042320206 | 1.806 | 2.118 | 2.091 |
| 4.090353634973795 | 1.808 | 2.121 | 2.092 |
| 4.093495227627385 | 1.81 | 2.124 | 2.092 |
| 4.096636820280975 | 1.813 | 2.127 | 2.092 |
| 4.099778412934564 | 1.815 | 2.13 | 2.092 |
| 4.102920005588154 | 1.817 | 2.132 | 2.093 |
| 4.106061598241744 | 1.819 | 2.135 | 2.093 |
| 4.109203190895333 | 1.821 | 2.138 | 2.093 |
| 4.112344783548923 | 1.823 | 2.141 | 2.093 |
| 4.115486376202512 | 1.825 | 2.143 | 2.093 |
| 4.118627968856102 | 1.827 | 2.146 | 2.093 |
| 4.121769561509692 | 1.83 | 2.149 | 2.093 |
| 4.124911154163281 | 1.832 | 2.151 | 2.094 |
| 4.128052746816871 | 1.834 | 2.154 | 2.094 |
| 4.13119433947046 | 1.836 | 2.157 | 2.094 |
| 4.13433593212405 | 1.838 | 2.159 | 2.094 |
| 4.13747752477764 | 1.841 | 2.162 | 2.094 |
| 4.14061911743123 | 1.843 | 2.165 | 2.094 |
| 4.143760710084818 | 1.845 | 2.167 | 2.094 |
| 4.146902302738408 | 1.847 | 2.17 | 2.094 |
| 4.150043895391998 | 1.849 | 2.172 | 2.094 |
| 4.153185488045588 | 1.852 | 2.175 | 2.094 |
| 4.156327080699177 | 1.854 | 2.177 | 2.094 |
| 4.159468673352766 | 1.856 | 2.18 | 2.094 |
| 4.162610266006356 | 1.859 | 2.182 | 2.094 |
| 4.165751858659946 | 1.861 | 2.185 | 2.094 |
| 4.168893451313535 | 1.863 | 2.187 | 2.094 |
| 4.172035043967125 | 1.865 | 2.19 | 2.094 |
| 4.175176636620715 | 1.868 | 2.192 | 2.094 |
| 4.178318229274304 | 1.87 | 2.195 | 2.094 |
| 4.181459821927894 | 1.872 | 2.197 | 2.094 |
| 4.184601414581484 | 1.875 | 2.199 | 2.094 |
| 4.187743007235073 | 1.877 | 2.202 | 2.094 |
| 4.190884599888663 | 1.879 | 2.204 | 2.094 |
| 4.194026192542252 | 1.882 | 2.207 | 2.094 |
| 4.197167785195842 | 1.884 | 2.209 | 2.094 |
| 4.200309377849432 | 1.887 | 2.211 | 2.094 |
| 4.203450970503021 | 1.889 | 2.213 | 2.094 |
| 4.206592563156611 | 1.891 | 2.216 | 2.094 |
| 4.2097341558102 | 1.894 | 2.218 | 2.094 |
| 4.21287574846379 | 1.896 | 2.22 | 2.094 |
| 4.21601734111738 | 1.899 | 2.222 | 2.094 |
| 4.21915893377097 | 1.901 | 2.225 | 2.094 |
| 4.222300526424559 | 1.904 | 2.227 | 2.095 |
| 4.225442119078148 | 1.906 | 2.229 | 2.095 |
| 4.228583711731738 | 1.908 | 2.231 | 2.095 |
| 4.231725304385327 | 1.911 | 2.233 | 2.095 |
| 4.234866897038917 | 1.913 | 2.235 | 2.095 |
| 4.238008489692506 | 1.916 | 2.237 | 2.095 |
| 4.241150082346096 | 1.918 | 2.239 | 2.095 |
| 4.244291674999685 | 1.921 | 2.242 | 2.095 |
| 4.247433267653276 | 1.923 | 2.244 | 2.095 |
| 4.250574860306865 | 1.926 | 2.246 | 2.095 |
| 4.253716452960455 | 1.928 | 2.248 | 2.095 |
| 4.256858045614044 | 1.931 | 2.25 | 2.095 |
| 4.259999638267634 | 1.933 | 2.251 | 2.095 |
| 4.263141230921224 | 1.936 | 2.253 | 2.096 |
| 4.266282823574813 | 1.939 | 2.255 | 2.096 |
| 4.269424416228403 | 1.941 | 2.257 | 2.096 |
| 4.272566008881992 | 1.944 | 2.259 | 2.096 |
| 4.275707601535582 | 1.946 | 2.261 | 2.096 |
| 4.27884919418917 | 1.949 | 2.263 | 2.097 |
| 4.28199078684276 | 1.951 | 2.265 | 2.097 |
| 4.285132379496351 | 1.954 | 2.266 | 2.097 |
| 4.28827397214994 | 1.957 | 2.268 | 2.097 |
| 4.29141556480353 | 1.959 | 2.27 | 2.098 |
| 4.294557157457119 | 1.962 | 2.272 | 2.098 |
| 4.29769875011071 | 1.964 | 2.273 | 2.098 |
| 4.300840342764299 | 1.967 | 2.275 | 2.099 |
| 4.303981935417888 | 1.97 | 2.277 | 2.099 |
| 4.307123528071478 | 1.972 | 2.278 | 2.099 |
| 4.310265120725067 | 1.975 | 2.28 | 2.1 |
| 4.313406713378657 | 1.978 | 2.282 | 2.1 |
| 4.316548306032247 | 1.98 | 2.283 | 2.1 |
| 4.319689898685836 | 1.983 | 2.285 | 2.101 |
| 4.322831491339426 | 1.986 | 2.286 | 2.101 |
| 4.325973083993015 | 1.988 | 2.288 | 2.102 |
| 4.329114676646605 | 1.991 | 2.289 | 2.102 |
| 4.332256269300195 | 1.994 | 2.291 | 2.103 |
| 4.335397861953784 | 1.997 | 2.292 | 2.103 |
| 4.338539454607374 | 1.999 | 2.294 | 2.104 |
| 4.341681047260963 | 2.002 | 2.295 | 2.105 |
| 4.344822639914553 | 2.005 | 2.297 | 2.105 |
| 4.347964232568143 | 2.007 | 2.298 | 2.106 |
| 4.351105825221732 | 2.01 | 2.3 | 2.107 |
| 4.354247417875322 | 2.013 | 2.301 | 2.107 |
| 4.357389010528911 | 2.016 | 2.302 | 2.108 |
| 4.360530603182501 | 2.019 | 2.304 | 2.109 |
| 4.36367219583609 | 2.021 | 2.305 | 2.11 |
| 4.36681378848968 | 2.024 | 2.306 | 2.11 |
| 4.36995538114327 | 2.027 | 2.307 | 2.111 |
| 4.373096973796859 | 2.03 | 2.309 | 2.112 |
| 4.376238566450449 | 2.032 | 2.31 | 2.113 |
| 4.379380159104038 | 2.035 | 2.311 | 2.114 |
| 4.382521751757628 | 2.038 | 2.312 | 2.115 |
| 4.385663344411217 | 2.041 | 2.314 | 2.116 |
| 4.388804937064807 | 2.044 | 2.315 | 2.117 |
| 4.391946529718397 | 2.046 | 2.316 | 2.118 |
| 4.395088122371987 | 2.049 | 2.317 | 2.119 |
| 4.398229715025576 | 2.052 | 2.318 | 2.12 |
| 4.401371307679165 | 2.055 | 2.319 | 2.121 |
| 4.404512900332755 | 2.058 | 2.32 | 2.122 |
| 4.407654492986345 | 2.061 | 2.321 | 2.123 |
| 4.410796085639934 | 2.064 | 2.322 | 2.124 |
| 4.413937678293524 | 2.066 | 2.323 | 2.126 |
| 4.417079270947114 | 2.069 | 2.324 | 2.127 |
| 4.420220863600703 | 2.072 | 2.325 | 2.128 |
| 4.423362456254293 | 2.075 | 2.326 | 2.129 |
| 4.426504048907883 | 2.078 | 2.327 | 2.131 |
| 4.429645641561472 | 2.081 | 2.328 | 2.132 |
| 4.432787234215062 | 2.084 | 2.329 | 2.134 |
| 4.435928826868651 | 2.087 | 2.33 | 2.135 |
| 4.43907041952224 | 2.09 | 2.331 | 2.136 |
| 4.44221201217583 | 2.092 | 2.331 | 2.138 |
| 4.44535360482942 | 2.095 | 2.332 | 2.139 |
| 4.44849519748301 | 2.098 | 2.333 | 2.141 |
| 4.4516367901366 | 2.101 | 2.334 | 2.142 |
| 4.454778382790188 | 2.104 | 2.335 | 2.144 |
| 4.457919975443779 | 2.107 | 2.335 | 2.146 |
| 4.461061568097368 | 2.11 | 2.336 | 2.147 |
| 4.464203160750958 | 2.113 | 2.337 | 2.149 |
| 4.467344753404547 | 2.116 | 2.337 | 2.151 |
| 4.470486346058137 | 2.119 | 2.338 | 2.153 |
| 4.473627938711726 | 2.122 | 2.339 | 2.154 |
| 4.476769531365316 | 2.125 | 2.34 | 2.156 |
| 4.479911124018905 | 2.128 | 2.34 | 2.158 |
| 4.483052716672495 | 2.131 | 2.341 | 2.16 |
| 4.486194309326085 | 2.134 | 2.341 | 2.162 |
| 4.489335901979674 | 2.137 | 2.342 | 2.164 |
| 4.492477494633264 | 2.14 | 2.343 | 2.166 |
| 4.495619087286854 | 2.143 | 2.343 | 2.167 |
| 4.498760679940443 | 2.146 | 2.344 | 2.17 |
| 4.501902272594033 | 2.149 | 2.344 | 2.172 |
| 4.505043865247622 | 2.152 | 2.345 | 2.174 |
| 4.508185457901212 | 2.155 | 2.345 | 2.176 |
| 4.511327050554801 | 2.158 | 2.346 | 2.178 |
| 4.514468643208391 | 2.161 | 2.346 | 2.18 |
| 4.517610235861981 | 2.164 | 2.347 | 2.182 |
| 4.520751828515571 | 2.167 | 2.347 | 2.184 |
| 4.52389342116916 | 2.17 | 2.348 | 2.187 |
| 4.52703501382275 | 2.173 | 2.348 | 2.189 |
| 4.530176606476339 | 2.176 | 2.348 | 2.191 |
| 4.533318199129928 | 2.179 | 2.349 | 2.193 |
| 4.536459791783518 | 2.182 | 2.349 | 2.196 |
| 4.539601384437108 | 2.185 | 2.349 | 2.198 |
| 4.542742977090698 | 2.188 | 2.35 | 2.2 |
| 4.545884569744287 | 2.191 | 2.35 | 2.203 |
| 4.549026162397876 | 2.194 | 2.351 | 2.205 |
| 4.552167755051466 | 2.197 | 2.351 | 2.208 |
| 4.555309347705056 | 2.2 | 2.351 | 2.21 |
| 4.558450940358646 | 2.203 | 2.351 | 2.213 |
| 4.561592533012235 | 2.207 | 2.352 | 2.215 |
| 4.564734125665825 | 2.21 | 2.352 | 2.218 |
| 4.567875718319415 | 2.213 | 2.352 | 2.22 |
| 4.571017310973004 | 2.216 | 2.352 | 2.223 |
| 4.574158903626594 | 2.219 | 2.353 | 2.226 |
| 4.577300496280183 | 2.222 | 2.353 | 2.228 |
| 4.580442088933772 | 2.225 | 2.353 | 2.231 |
| 4.583583681587362 | 2.228 | 2.353 | 2.234 |
| 4.586725274240952 | 2.231 | 2.354 | 2.236 |
| 4.589866866894542 | 2.234 | 2.354 | 2.239 |
| 4.593008459548131 | 2.237 | 2.354 | 2.242 |
| 4.596150052201721 | 2.24 | 2.354 | 2.245 |
| 4.59929164485531 | 2.244 | 2.354 | 2.247 |
| 4.6024332375089 | 2.247 | 2.354 | 2.25 |
| 4.60557483016249 | 2.25 | 2.355 | 2.253 |
| 4.608716422816079 | 2.253 | 2.355 | 2.256 |
| 4.611858015469668 | 2.256 | 2.355 | 2.259 |
| 4.614999608123258 | 2.259 | 2.355 | 2.262 |
| 4.618141200776848 | 2.262 | 2.355 | 2.264 |
| 4.621282793430437 | 2.265 | 2.355 | 2.267 |
| 4.624424386084027 | 2.268 | 2.355 | 2.27 |
| 4.627565978737617 | 2.272 | 2.355 | 2.273 |
| 4.630707571391206 | 2.275 | 2.355 | 2.276 |
| 4.633849164044795 | 2.278 | 2.356 | 2.279 |
| 4.636990756698386 | 2.281 | 2.356 | 2.282 |
| 4.640132349351975 | 2.284 | 2.356 | 2.285 |
| 4.643273942005564 | 2.287 | 2.356 | 2.288 |
| 4.646415534659154 | 2.29 | 2.356 | 2.291 |
| 4.649557127312744 | 2.293 | 2.356 | 2.294 |
| 4.652698719966334 | 2.297 | 2.356 | 2.297 |
| 4.655840312619923 | 2.3 | 2.356 | 2.3 |
| 4.658981905273513 | 2.303 | 2.356 | 2.303 |
| 4.662123497927102 | 2.306 | 2.356 | 2.306 |
| 4.665265090580692 | 2.309 | 2.356 | 2.309 |
| 4.668406683234282 | 2.312 | 2.356 | 2.312 |
| 4.671548275887871 | 2.315 | 2.356 | 2.316 |
| 4.674689868541461 | 2.319 | 2.356 | 2.319 |
| 4.67783146119505 | 2.322 | 2.356 | 2.322 |
| 4.68097305384864 | 2.325 | 2.356 | 2.325 |
| 4.68411464650223 | 2.328 | 2.356 | 2.328 |
| 4.687256239155819 | 2.331 | 2.356 | 2.331 |
| 4.690397831809409 | 2.334 | 2.356 | 2.334 |
| 4.693539424462998 | 2.337 | 2.356 | 2.337 |
| 4.696681017116588 | 2.34 | 2.356 | 2.34 |
| 4.699822609770177 | 2.344 | 2.356 | 2.344 |
| 4.702964202423767 | 2.347 | 2.356 | 2.347 |
| 4.706105795077356 | 2.35 | 2.356 | 2.35 |
| 4.709247387730946 | 2.353 | 2.356 | 2.353 |
| 4.712388980384535 | 2.356 | 2.356 | 2.356 |
| 4.715530573038126 | 2.359 | 2.356 | 2.359 |
| 4.718672165691715 | 2.362 | 2.356 | 2.362 |
| 4.721813758345305 | 2.366 | 2.356 | 2.366 |
| 4.724955350998894 | 2.369 | 2.356 | 2.369 |
| 4.728096943652484 | 2.372 | 2.356 | 2.372 |
| 4.731238536306074 | 2.375 | 2.356 | 2.375 |
| 4.734380128959663 | 2.378 | 2.356 | 2.378 |
| 4.737521721613253 | 2.381 | 2.356 | 2.381 |
| 4.740663314266842 | 2.384 | 2.356 | 2.384 |
| 4.743804906920432 | 2.388 | 2.356 | 2.388 |
| 4.74694649957402 | 2.391 | 2.356 | 2.391 |
| 4.750088092227611 | 2.394 | 2.356 | 2.394 |
| 4.7532296848812 | 2.397 | 2.356 | 2.397 |
| 4.75637127753479 | 2.4 | 2.356 | 2.4 |
| 4.75951287018838 | 2.403 | 2.356 | 2.403 |
| 4.76265446284197 | 2.406 | 2.356 | 2.406 |
| 4.765796055495559 | 2.41 | 2.356 | 2.409 |
| 4.768937648149149 | 2.413 | 2.356 | 2.412 |
| 4.772079240802738 | 2.416 | 2.356 | 2.415 |
| 4.775220833456327 | 2.419 | 2.357 | 2.418 |
| 4.778362426109917 | 2.422 | 2.357 | 2.421 |
| 4.781504018763507 | 2.425 | 2.357 | 2.424 |
| 4.784645611417097 | 2.428 | 2.357 | 2.427 |
| 4.787787204070686 | 2.431 | 2.357 | 2.43 |
| 4.790928796724275 | 2.435 | 2.357 | 2.433 |
| 4.794070389377865 | 2.438 | 2.357 | 2.436 |
| 4.797211982031455 | 2.441 | 2.357 | 2.439 |
| 4.800353574685045 | 2.444 | 2.357 | 2.442 |
| 4.803495167338634 | 2.447 | 2.357 | 2.445 |
| 4.806636759992224 | 2.45 | 2.357 | 2.448 |
| 4.809778352645814 | 2.453 | 2.357 | 2.451 |
| 4.812919945299403 | 2.456 | 2.358 | 2.454 |
| 4.816061537952993 | 2.459 | 2.358 | 2.457 |
| 4.819203130606582 | 2.463 | 2.358 | 2.459 |
| 4.822344723260172 | 2.466 | 2.358 | 2.462 |
| 4.825486315913761 | 2.469 | 2.358 | 2.465 |
| 4.828627908567351 | 2.472 | 2.358 | 2.468 |
| 4.83176950122094 | 2.475 | 2.358 | 2.471 |
| 4.83491109387453 | 2.478 | 2.359 | 2.473 |
| 4.83805268652812 | 2.481 | 2.359 | 2.476 |
| 4.841194279181709 | 2.484 | 2.359 | 2.479 |
| 4.844335871835299 | 2.487 | 2.359 | 2.481 |
| 4.847477464488889 | 2.49 | 2.359 | 2.484 |
| 4.850619057142478 | 2.494 | 2.36 | 2.487 |
| 4.853760649796068 | 2.497 | 2.36 | 2.489 |
| 4.856902242449657 | 2.5 | 2.36 | 2.492 |
| 4.860043835103247 | 2.503 | 2.36 | 2.495 |
| 4.863185427756837 | 2.506 | 2.361 | 2.497 |
| 4.866327020410426 | 2.509 | 2.361 | 2.5 |
| 4.869468613064015 | 2.512 | 2.361 | 2.502 |
| 4.872610205717605 | 2.515 | 2.362 | 2.505 |
| 4.875751798371195 | 2.518 | 2.362 | 2.507 |
| 4.878893391024784 | 2.521 | 2.362 | 2.51 |
| 4.882034983678374 | 2.524 | 2.363 | 2.512 |
| 4.885176576331964 | 2.527 | 2.363 | 2.514 |
| 4.888318168985553 | 2.53 | 2.363 | 2.517 |
| 4.891459761639143 | 2.533 | 2.364 | 2.519 |
| 4.894601354292733 | 2.536 | 2.364 | 2.521 |
| 4.897742946946322 | 2.539 | 2.364 | 2.524 |
| 4.900884539599912 | 2.542 | 2.365 | 2.526 |
| 4.904026132253501 | 2.546 | 2.365 | 2.528 |
| 4.907167724907091 | 2.549 | 2.366 | 2.53 |
| 4.91030931756068 | 2.552 | 2.366 | 2.532 |
| 4.91345091021427 | 2.555 | 2.367 | 2.535 |
| 4.91659250286786 | 2.558 | 2.367 | 2.537 |
| 4.91973409552145 | 2.561 | 2.368 | 2.539 |
| 4.922875688175039 | 2.564 | 2.368 | 2.541 |
| 4.926017280828628 | 2.567 | 2.369 | 2.543 |
| 4.929158873482218 | 2.57 | 2.369 | 2.545 |
| 4.932300466135808 | 2.573 | 2.37 | 2.547 |
| 4.935442058789397 | 2.576 | 2.37 | 2.549 |
| 4.938583651442987 | 2.579 | 2.371 | 2.551 |
| 4.941725244096576 | 2.582 | 2.372 | 2.553 |
| 4.944866836750166 | 2.585 | 2.372 | 2.554 |
| 4.948008429403755 | 2.588 | 2.373 | 2.556 |
| 4.951150022057345 | 2.59 | 2.374 | 2.558 |
| 4.954291614710935 | 2.593 | 2.374 | 2.56 |
| 4.957433207364524 | 2.596 | 2.375 | 2.562 |
| 4.960574800018114 | 2.599 | 2.376 | 2.563 |
| 4.963716392671704 | 2.602 | 2.376 | 2.565 |
| 4.966857985325293 | 2.605 | 2.377 | 2.567 |
| 4.969999577978883 | 2.608 | 2.378 | 2.568 |
| 4.973141170632472 | 2.611 | 2.379 | 2.57 |
| 4.976282763286062 | 2.614 | 2.379 | 2.571 |
| 4.979424355939651 | 2.617 | 2.38 | 2.573 |
| 4.982565948593241 | 2.62 | 2.381 | 2.575 |
| 4.985707541246831 | 2.623 | 2.382 | 2.576 |
| 4.98884913390042 | 2.626 | 2.383 | 2.577 |
| 4.99199072655401 | 2.629 | 2.384 | 2.579 |
| 4.9951323192076 | 2.632 | 2.384 | 2.58 |
| 4.99827391186119 | 2.634 | 2.385 | 2.582 |
| 5.00141550451478 | 2.637 | 2.386 | 2.583 |
| 5.004557097168369 | 2.64 | 2.387 | 2.584 |
| 5.007698689821958 | 2.643 | 2.388 | 2.586 |
| 5.010840282475548 | 2.646 | 2.389 | 2.587 |
| 5.013981875129137 | 2.649 | 2.39 | 2.588 |
| 5.017123467782727 | 2.652 | 2.391 | 2.589 |
| 5.020265060436317 | 2.655 | 2.392 | 2.59 |
| 5.023406653089906 | 2.657 | 2.393 | 2.591 |
| 5.026548245743496 | 2.66 | 2.394 | 2.593 |
| 5.029689838397085 | 2.663 | 2.395 | 2.594 |
| 5.032831431050674 | 2.666 | 2.397 | 2.595 |
| 5.035973023704264 | 2.669 | 2.398 | 2.596 |
| 5.039114616357854 | 2.672 | 2.399 | 2.597 |
| 5.042256209011444 | 2.674 | 2.4 | 2.598 |
| 5.045397801665033 | 2.677 | 2.401 | 2.599 |
| 5.048539394318622 | 2.68 | 2.402 | 2.599 |
| 5.051680986972213 | 2.683 | 2.404 | 2.6 |
| 5.054822579625802 | 2.686 | 2.405 | 2.601 |
| 5.057964172279392 | 2.688 | 2.406 | 2.602 |
| 5.061105764932981 | 2.691 | 2.407 | 2.603 |
| 5.064247357586571 | 2.694 | 2.409 | 2.604 |
| 5.067388950240161 | 2.697 | 2.41 | 2.604 |
| 5.07053054289375 | 2.699 | 2.411 | 2.605 |
| 5.07367213554734 | 2.702 | 2.413 | 2.606 |
| 5.07681372820093 | 2.705 | 2.414 | 2.606 |
| 5.079955320854519 | 2.708 | 2.416 | 2.607 |
| 5.083096913508108 | 2.71 | 2.417 | 2.608 |
| 5.086238506161698 | 2.713 | 2.418 | 2.608 |
| 5.089380098815288 | 2.716 | 2.42 | 2.609 |
| 5.092521691468877 | 2.719 | 2.421 | 2.609 |
| 5.095663284122466 | 2.721 | 2.423 | 2.61 |
| 5.098804876776057 | 2.724 | 2.424 | 2.611 |
| 5.101946469429646 | 2.727 | 2.426 | 2.611 |
| 5.105088062083236 | 2.729 | 2.428 | 2.611 |
| 5.108229654736825 | 2.732 | 2.429 | 2.612 |
| 5.111371247390415 | 2.735 | 2.431 | 2.612 |
| 5.114512840044005 | 2.737 | 2.432 | 2.613 |
| 5.117654432697594 | 2.74 | 2.434 | 2.613 |
| 5.120796025351184 | 2.743 | 2.436 | 2.614 |
| 5.123937618004773 | 2.745 | 2.437 | 2.614 |
| 5.127079210658363 | 2.748 | 2.439 | 2.614 |
| 5.130220803311953 | 2.751 | 2.441 | 2.615 |
| 5.133362395965542 | 2.753 | 2.442 | 2.615 |
| 5.136503988619131 | 2.756 | 2.444 | 2.615 |
| 5.13964558127272 | 2.758 | 2.446 | 2.615 |
| 5.142787173926311 | 2.761 | 2.448 | 2.616 |
| 5.1459287665799 | 2.764 | 2.45 | 2.616 |
| 5.14907035923349 | 2.766 | 2.451 | 2.616 |
| 5.15221195188708 | 2.769 | 2.453 | 2.616 |
| 5.15535354454067 | 2.771 | 2.455 | 2.616 |
| 5.158495137194259 | 2.774 | 2.457 | 2.617 |
| 5.161636729847848 | 2.776 | 2.459 | 2.617 |
| 5.164778322501438 | 2.779 | 2.461 | 2.617 |
| 5.167919915155028 | 2.781 | 2.463 | 2.617 |
| 5.171061507808617 | 2.784 | 2.465 | 2.617 |
| 5.174203100462206 | 2.787 | 2.467 | 2.617 |
| 5.177344693115796 | 2.789 | 2.469 | 2.617 |
| 5.180486285769386 | 2.792 | 2.471 | 2.617 |
| 5.183627878422976 | 2.794 | 2.473 | 2.618 |
| 5.186769471076565 | 2.797 | 2.475 | 2.618 |
| 5.189911063730155 | 2.799 | 2.477 | 2.618 |
| 5.193052656383744 | 2.802 | 2.479 | 2.618 |
| 5.196194249037334 | 2.804 | 2.481 | 2.618 |
| 5.199335841690924 | 2.806 | 2.483 | 2.618 |
| 5.202477434344513 | 2.809 | 2.486 | 2.618 |
| 5.205619026998103 | 2.811 | 2.488 | 2.618 |
| 5.208760619651692 | 2.814 | 2.49 | 2.618 |
| 5.211902212305282 | 2.816 | 2.492 | 2.618 |
| 5.215043804958871 | 2.819 | 2.494 | 2.618 |
| 5.218185397612461 | 2.821 | 2.497 | 2.618 |
| 5.221326990266051 | 2.823 | 2.499 | 2.618 |
| 5.22446858291964 | 2.826 | 2.501 | 2.618 |
| 5.22761017557323 | 2.828 | 2.504 | 2.618 |
| 5.23075176822682 | 2.831 | 2.506 | 2.618 |
| 5.23389336088041 | 2.833 | 2.508 | 2.618 |
| 5.237034953533999 | 2.835 | 2.511 | 2.618 |
| 5.240176546187588 | 2.838 | 2.513 | 2.618 |
| 5.243318138841178 | 2.84 | 2.515 | 2.618 |
| 5.246459731494767 | 2.842 | 2.518 | 2.618 |
| 5.249601324148357 | 2.845 | 2.52 | 2.618 |
| 5.252742916801947 | 2.847 | 2.523 | 2.618 |
| 5.255884509455536 | 2.849 | 2.525 | 2.618 |
| 5.259026102109125 | 2.852 | 2.527 | 2.618 |
| 5.262167694762715 | 2.854 | 2.53 | 2.618 |
| 5.265309287416305 | 2.856 | 2.532 | 2.618 |
| 5.268450880069895 | 2.858 | 2.535 | 2.618 |
| 5.271592472723484 | 2.861 | 2.538 | 2.618 |
| 5.274734065377074 | 2.863 | 2.54 | 2.618 |
| 5.277875658030664 | 2.865 | 2.543 | 2.618 |
| 5.281017250684253 | 2.867 | 2.545 | 2.618 |
| 5.284158843337843 | 2.87 | 2.548 | 2.618 |
| 5.287300435991432 | 2.872 | 2.55 | 2.618 |
| 5.290442028645022 | 2.874 | 2.553 | 2.618 |
| 5.293583621298612 | 2.876 | 2.556 | 2.619 |
| 5.296725213952201 | 2.878 | 2.558 | 2.619 |
| 5.299866806605791 | 2.881 | 2.561 | 2.619 |
| 5.30300839925938 | 2.883 | 2.564 | 2.619 |
| 5.30614999191297 | 2.885 | 2.566 | 2.619 |
| 5.30929158456656 | 2.887 | 2.569 | 2.619 |
| 5.312433177220149 | 2.889 | 2.572 | 2.619 |
| 5.315574769873739 | 2.891 | 2.575 | 2.619 |
| 5.318716362527328 | 2.893 | 2.577 | 2.62 |
| 5.321857955180918 | 2.896 | 2.58 | 2.62 |
| 5.324999547834508 | 2.898 | 2.583 | 2.62 |
| 5.328141140488097 | 2.9 | 2.586 | 2.62 |
| 5.331282733141686 | 2.902 | 2.588 | 2.621 |
| 5.334424325795276 | 2.904 | 2.591 | 2.621 |
| 5.337565918448866 | 2.906 | 2.594 | 2.621 |
| 5.340707511102456 | 2.908 | 2.597 | 2.621 |
| 5.343849103756045 | 2.91 | 2.6 | 2.622 |
| 5.346990696409634 | 2.912 | 2.603 | 2.622 |
| 5.350132289063224 | 2.914 | 2.605 | 2.622 |
| 5.353273881716814 | 2.916 | 2.608 | 2.623 |
| 5.356415474370403 | 2.918 | 2.611 | 2.623 |
| 5.359557067023993 | 2.92 | 2.614 | 2.624 |
| 5.362698659677583 | 2.922 | 2.617 | 2.624 |
| 5.365840252331172 | 2.924 | 2.62 | 2.624 |
| 5.368981844984762 | 2.926 | 2.623 | 2.625 |
| 5.372123437638351 | 2.928 | 2.626 | 2.625 |
| 5.375265030291941 | 2.93 | 2.629 | 2.626 |
| 5.378406622945531 | 2.932 | 2.632 | 2.626 |
| 5.38154821559912 | 2.934 | 2.635 | 2.627 |
| 5.38468980825271 | 2.936 | 2.638 | 2.627 |
| 5.387831400906299 | 2.938 | 2.641 | 2.628 |
| 5.39097299355989 | 2.94 | 2.644 | 2.629 |
| 5.394114586213479 | 2.942 | 2.647 | 2.629 |
| 5.397256178867068 | 2.944 | 2.65 | 2.63 |
| 5.400397771520657 | 2.945 | 2.653 | 2.631 |
| 5.403539364174247 | 2.947 | 2.656 | 2.631 |
| 5.406680956827837 | 2.949 | 2.659 | 2.632 |
| 5.409822549481426 | 2.951 | 2.662 | 2.633 |
| 5.412964142135016 | 2.953 | 2.665 | 2.634 |
| 5.416105734788605 | 2.955 | 2.668 | 2.635 |
| 5.419247327442195 | 2.957 | 2.671 | 2.635 |
| 5.422388920095785 | 2.958 | 2.674 | 2.636 |
| 5.425530512749375 | 2.96 | 2.677 | 2.637 |
| 5.428672105402964 | 2.962 | 2.68 | 2.638 |
| 5.431813698056554 | 2.964 | 2.683 | 2.639 |
| 5.434955290710143 | 2.966 | 2.686 | 2.64 |
| 5.438096883363733 | 2.967 | 2.689 | 2.641 |
| 5.441238476017322 | 2.969 | 2.693 | 2.642 |
| 5.444380068670912 | 2.971 | 2.696 | 2.643 |
| 5.447521661324502 | 2.972 | 2.699 | 2.644 |
| 5.450663253978091 | 2.974 | 2.702 | 2.645 |
| 5.453804846631681 | 2.976 | 2.705 | 2.646 |
| 5.456946439285271 | 2.978 | 2.708 | 2.648 |
| 5.46008803193886 | 2.979 | 2.711 | 2.649 |
| 5.46322962459245 | 2.981 | 2.714 | 2.65 |
| 5.466371217246039 | 2.983 | 2.718 | 2.651 |
| 5.46951280989963 | 2.984 | 2.721 | 2.653 |
| 5.472654402553218 | 2.986 | 2.724 | 2.654 |
| 5.475795995206808 | 2.988 | 2.727 | 2.655 |
| 5.478937587860398 | 2.989 | 2.73 | 2.657 |
| 5.482079180513987 | 2.991 | 2.733 | 2.658 |
| 5.485220773167577 | 2.993 | 2.736 | 2.66 |
| 5.488362365821166 | 2.994 | 2.739 | 2.661 |
| 5.491503958474756 | 2.996 | 2.743 | 2.662 |
| 5.494645551128346 | 2.997 | 2.746 | 2.664 |
| 5.497787143781935 | 2.999 | 2.749 | 2.666 |
| 5.500928736435525 | 3 | 2.752 | 2.667 |
| 5.504070329089115 | 3.002 | 2.755 | 2.669 |
| 5.507211921742704 | 3.004 | 2.758 | 2.67 |
| 5.510353514396294 | 3.005 | 2.761 | 2.672 |
| 5.513495107049883 | 3.007 | 2.765 | 2.674 |
| 5.516636699703473 | 3.008 | 2.768 | 2.676 |
| 5.519778292357062 | 3.01 | 2.771 | 2.677 |
| 5.522919885010652 | 3.011 | 2.774 | 2.679 |
| 5.526061477664242 | 3.013 | 2.777 | 2.681 |
| 5.529203070317831 | 3.014 | 2.78 | 2.683 |
| 5.532344662971421 | 3.016 | 2.783 | 2.685 |
| 5.535486255625011 | 3.017 | 2.787 | 2.687 |
| 5.5386278482786 | 3.018 | 2.79 | 2.688 |
| 5.54176944093219 | 3.02 | 2.793 | 2.69 |
| 5.544911033585779 | 3.021 | 2.796 | 2.692 |
| 5.54805262623937 | 3.023 | 2.799 | 2.694 |
| 5.551194218892959 | 3.024 | 2.802 | 2.697 |
| 5.554335811546548 | 3.026 | 2.805 | 2.699 |
| 5.557477404200137 | 3.027 | 2.808 | 2.701 |
| 5.560618996853727 | 3.028 | 2.811 | 2.703 |
| 5.563760589507317 | 3.03 | 2.814 | 2.705 |
| 5.566902182160906 | 3.031 | 2.818 | 2.707 |
| 5.570043774814496 | 3.032 | 2.821 | 2.709 |
| 5.573185367468086 | 3.034 | 2.824 | 2.712 |
| 5.576326960121675 | 3.035 | 2.827 | 2.714 |
| 5.579468552775264 | 3.036 | 2.83 | 2.716 |
| 5.582610145428854 | 3.038 | 2.833 | 2.719 |
| 5.585751738082444 | 3.039 | 2.836 | 2.721 |
| 5.588893330736034 | 3.04 | 2.839 | 2.723 |
| 5.592034923389623 | 3.042 | 2.842 | 2.726 |
| 5.595176516043213 | 3.043 | 2.845 | 2.728 |
| 5.598318108696803 | 3.044 | 2.848 | 2.731 |
| 5.601459701350392 | 3.045 | 2.851 | 2.733 |
| 5.604601294003982 | 3.047 | 2.854 | 2.736 |
| 5.607742886657571 | 3.048 | 2.857 | 2.738 |
| 5.610884479311161 | 3.049 | 2.86 | 2.741 |
| 5.61402607196475 | 3.05 | 2.863 | 2.743 |
| 5.61716766461834 | 3.051 | 2.866 | 2.746 |
| 5.62030925727193 | 3.053 | 2.869 | 2.748 |
| 5.623450849925519 | 3.054 | 2.872 | 2.751 |
| 5.626592442579109 | 3.055 | 2.875 | 2.754 |
| 5.629734035232698 | 3.056 | 2.878 | 2.756 |
| 5.632875627886288 | 3.057 | 2.881 | 2.759 |
| 5.636017220539878 | 3.059 | 2.884 | 2.762 |
| 5.639158813193467 | 3.06 | 2.887 | 2.764 |
| 5.642300405847057 | 3.061 | 2.889 | 2.767 |
| 5.645441998500646 | 3.062 | 2.892 | 2.77 |
| 5.648583591154236 | 3.063 | 2.895 | 2.773 |
| 5.651725183807825 | 3.064 | 2.898 | 2.776 |
| 5.654866776461415 | 3.065 | 2.901 | 2.778 |
| 5.658008369115005 | 3.066 | 2.904 | 2.781 |
| 5.661149961768594 | 3.067 | 2.907 | 2.784 |
| 5.664291554422184 | 3.068 | 2.909 | 2.787 |
| 5.667433147075774 | 3.069 | 2.912 | 2.79 |
| 5.670574739729363 | 3.071 | 2.915 | 2.793 |
| 5.673716332382953 | 3.072 | 2.918 | 2.796 |
| 5.676857925036542 | 3.073 | 2.921 | 2.799 |
| 5.679999517690132 | 3.074 | 2.923 | 2.802 |
| 5.683141110343721 | 3.075 | 2.926 | 2.805 |
| 5.686282702997311 | 3.076 | 2.929 | 2.808 |
| 5.689424295650901 | 3.077 | 2.931 | 2.811 |
| 5.69256588830449 | 3.078 | 2.934 | 2.814 |
| 5.69570748095808 | 3.079 | 2.937 | 2.817 |
| 5.69884907361167 | 3.079 | 2.939 | 2.82 |
| 5.701990666265259 | 3.08 | 2.942 | 2.823 |
| 5.705132258918849 | 3.081 | 2.945 | 2.826 |
| 5.708273851572438 | 3.082 | 2.947 | 2.829 |
| 5.711415444226028 | 3.083 | 2.95 | 2.832 |
| 5.714557036879618 | 3.084 | 2.953 | 2.835 |
| 5.717698629533207 | 3.085 | 2.955 | 2.838 |
| 5.720840222186797 | 3.086 | 2.958 | 2.841 |
| 5.723981814840386 | 3.087 | 2.96 | 2.844 |
| 5.727123407493976 | 3.088 | 2.963 | 2.847 |
| 5.730265000147565 | 3.089 | 2.965 | 2.851 |
| 5.733406592801155 | 3.089 | 2.968 | 2.854 |
| 5.736548185454744 | 3.09 | 2.97 | 2.857 |
| 5.739689778108334 | 3.091 | 2.973 | 2.86 |
| 5.742831370761924 | 3.092 | 2.975 | 2.863 |
| 5.745972963415514 | 3.093 | 2.978 | 2.866 |
| 5.749114556069103 | 3.094 | 2.98 | 2.869 |
| 5.752256148722693 | 3.094 | 2.983 | 2.872 |
| 5.755397741376282 | 3.095 | 2.985 | 2.876 |
| 5.758539334029872 | 3.096 | 2.987 | 2.879 |
| 5.761680926683462 | 3.097 | 2.99 | 2.882 |
| 5.764822519337051 | 3.098 | 2.992 | 2.885 |
| 5.767964111990641 | 3.098 | 2.994 | 2.888 |
| 5.77110570464423 | 3.099 | 2.997 | 2.891 |
| 5.77424729729782 | 3.1 | 2.999 | 2.894 |
| 5.77738888995141 | 3.101 | 3.001 | 2.898 |
| 5.780530482605 | 3.101 | 3.003 | 2.901 |
| 5.783672075258588 | 3.102 | 3.006 | 2.904 |
| 5.786813667912178 | 3.103 | 3.008 | 2.907 |
| 5.789955260565768 | 3.103 | 3.01 | 2.91 |
| 5.793096853219358 | 3.104 | 3.012 | 2.913 |
| 5.796238445872947 | 3.105 | 3.014 | 2.916 |
| 5.799380038526537 | 3.106 | 3.016 | 2.919 |
| 5.802521631180126 | 3.106 | 3.019 | 2.922 |
| 5.805663223833715 | 3.107 | 3.021 | 2.926 |
| 5.808804816487306 | 3.108 | 3.023 | 2.929 |
| 5.811946409140895 | 3.108 | 3.025 | 2.932 |
| 5.815088001794485 | 3.109 | 3.027 | 2.935 |
| 5.818229594448074 | 3.11 | 3.029 | 2.938 |
| 5.821371187101663 | 3.11 | 3.031 | 2.941 |
| 5.824512779755254 | 3.111 | 3.033 | 2.944 |
| 5.827654372408843 | 3.111 | 3.035 | 2.947 |
| 5.830795965062433 | 3.112 | 3.037 | 2.95 |
| 5.833937557716022 | 3.113 | 3.039 | 2.953 |
| 5.837079150369612 | 3.113 | 3.041 | 2.956 |
| 5.840220743023201 | 3.114 | 3.043 | 2.959 |
| 5.843362335676791 | 3.114 | 3.044 | 2.962 |
| 5.846503928330381 | 3.115 | 3.046 | 2.965 |
| 5.84964552098397 | 3.115 | 3.048 | 2.968 |
| 5.85278711363756 | 3.116 | 3.05 | 2.971 |
| 5.85592870629115 | 3.117 | 3.052 | 2.973 |
| 5.85907029894474 | 3.117 | 3.054 | 2.976 |
| 5.862211891598329 | 3.118 | 3.055 | 2.979 |
| 5.865353484251918 | 3.118 | 3.057 | 2.982 |
| 5.868495076905508 | 3.119 | 3.059 | 2.985 |
| 5.871636669559098 | 3.119 | 3.06 | 2.988 |
| 5.874778262212687 | 3.12 | 3.062 | 2.991 |
| 5.877919854866277 | 3.12 | 3.064 | 2.993 |
| 5.881061447519866 | 3.121 | 3.065 | 2.996 |
| 5.884203040173456 | 3.121 | 3.067 | 2.999 |
| 5.887344632827046 | 3.122 | 3.069 | 3.001 |
| 5.890486225480635 | 3.122 | 3.07 | 3.004 |
| 5.893627818134224 | 3.122 | 3.072 | 3.007 |
| 5.896769410787814 | 3.123 | 3.073 | 3.009 |
| 5.899911003441404 | 3.123 | 3.075 | 3.012 |
| 5.903052596094994 | 3.124 | 3.076 | 3.015 |
| 5.906194188748583 | 3.124 | 3.078 | 3.017 |
| 5.909335781402172 | 3.125 | 3.079 | 3.02 |
| 5.912477374055762 | 3.125 | 3.081 | 3.022 |
| 5.915618966709352 | 3.125 | 3.082 | 3.025 |
| 5.918760559362942 | 3.126 | 3.084 | 3.027 |
| 5.921902152016531 | 3.126 | 3.085 | 3.03 |
| 5.92504374467012 | 3.127 | 3.086 | 3.032 |
| 5.92818533732371 | 3.127 | 3.088 | 3.035 |
| 5.9313269299773 | 3.127 | 3.089 | 3.037 |
| 5.93446852263089 | 3.128 | 3.09 | 3.039 |
| 5.93761011528448 | 3.128 | 3.092 | 3.042 |
| 5.940751707938068 | 3.129 | 3.093 | 3.044 |
| 5.943893300591658 | 3.129 | 3.094 | 3.046 |
| 5.947034893245248 | 3.129 | 3.095 | 3.049 |
| 5.950176485898837 | 3.13 | 3.097 | 3.051 |
| 5.953318078552427 | 3.13 | 3.098 | 3.053 |
| 5.956459671206017 | 3.13 | 3.099 | 3.055 |
| 5.959601263859606 | 3.131 | 3.1 | 3.057 |
| 5.962742856513196 | 3.131 | 3.101 | 3.06 |
| 5.965884449166785 | 3.131 | 3.102 | 3.062 |
| 5.969026041820375 | 3.131 | 3.103 | 3.064 |
| 5.972167634473964 | 3.132 | 3.104 | 3.066 |
| 5.975309227127554 | 3.132 | 3.106 | 3.068 |
| 5.978450819781144 | 3.132 | 3.107 | 3.07 |
| 5.981592412434733 | 3.133 | 3.108 | 3.072 |
| 5.984734005088323 | 3.133 | 3.109 | 3.074 |
| 5.987875597741913 | 3.133 | 3.11 | 3.076 |
| 5.991017190395502 | 3.133 | 3.111 | 3.077 |
| 5.994158783049092 | 3.134 | 3.111 | 3.079 |
| 5.997300375702681 | 3.134 | 3.112 | 3.081 |
| 6.000441968356271 | 3.134 | 3.113 | 3.083 |
| 6.003583561009861 | 3.134 | 3.114 | 3.085 |
| 6.00672515366345 | 3.135 | 3.115 | 3.086 |
| 6.00986674631704 | 3.135 | 3.116 | 3.088 |
| 6.01300833897063 | 3.135 | 3.117 | 3.09 |
| 6.01614993162422 | 3.135 | 3.118 | 3.091 |
| 6.019291524277808 | 3.136 | 3.118 | 3.093 |
| 6.022433116931398 | 3.136 | 3.119 | 3.095 |
| 6.025574709584988 | 3.136 | 3.12 | 3.096 |
| 6.028716302238577 | 3.136 | 3.121 | 3.098 |
| 6.031857894892167 | 3.136 | 3.121 | 3.099 |
| 6.034999487545757 | 3.137 | 3.122 | 3.101 |
| 6.038141080199346 | 3.137 | 3.123 | 3.102 |
| 6.041282672852935 | 3.137 | 3.124 | 3.103 |
| 6.044424265506525 | 3.137 | 3.124 | 3.105 |
| 6.047565858160115 | 3.137 | 3.125 | 3.106 |
| 6.050707450813704 | 3.137 | 3.126 | 3.107 |
| 6.053849043467294 | 3.138 | 3.126 | 3.109 |
| 6.056990636120884 | 3.138 | 3.127 | 3.11 |
| 6.060132228774473 | 3.138 | 3.127 | 3.111 |
| 6.063273821428063 | 3.138 | 3.128 | 3.112 |
| 6.066415414081653 | 3.138 | 3.129 | 3.114 |
| 6.069557006735242 | 3.138 | 3.129 | 3.115 |
| 6.072698599388831 | 3.139 | 3.13 | 3.116 |
| 6.07584019204242 | 3.139 | 3.13 | 3.117 |
| 6.078981784696011 | 3.139 | 3.131 | 3.118 |
| 6.082123377349601 | 3.139 | 3.131 | 3.119 |
| 6.08526497000319 | 3.139 | 3.132 | 3.12 |
| 6.08840656265678 | 3.139 | 3.132 | 3.121 |
| 6.09154815531037 | 3.139 | 3.132 | 3.122 |
| 6.094689747963959 | 3.139 | 3.133 | 3.123 |
| 6.097831340617549 | 3.139 | 3.133 | 3.124 |
| 6.100972933271138 | 3.14 | 3.134 | 3.124 |
| 6.104114525924728 | 3.14 | 3.134 | 3.125 |
| 6.107256118578317 | 3.14 | 3.135 | 3.126 |
| 6.110397711231907 | 3.14 | 3.135 | 3.127 |
| 6.113539303885497 | 3.14 | 3.135 | 3.128 |
| 6.116680896539086 | 3.14 | 3.136 | 3.128 |
| 6.119822489192675 | 3.14 | 3.136 | 3.129 |
| 6.122964081846265 | 3.14 | 3.136 | 3.13 |
| 6.126105674499855 | 3.14 | 3.137 | 3.13 |
| 6.129247267153445 | 3.14 | 3.137 | 3.131 |
| 6.132388859807034 | 3.14 | 3.137 | 3.132 |
| 6.135530452460624 | 3.141 | 3.137 | 3.132 |
| 6.138672045114213 | 3.141 | 3.138 | 3.133 |
| 6.141813637767803 | 3.141 | 3.138 | 3.133 |
| 6.144955230421393 | 3.141 | 3.138 | 3.134 |
| 6.148096823074982 | 3.141 | 3.138 | 3.134 |
| 6.151238415728571 | 3.141 | 3.139 | 3.135 |
| 6.154380008382161 | 3.141 | 3.139 | 3.135 |
| 6.157521601035751 | 3.141 | 3.139 | 3.136 |
| 6.16066319368934 | 3.141 | 3.139 | 3.136 |
| 6.16380478634293 | 3.141 | 3.139 | 3.137 |
| 6.16694637899652 | 3.141 | 3.14 | 3.137 |
| 6.170087971650109 | 3.141 | 3.14 | 3.137 |
| 6.173229564303698 | 3.141 | 3.14 | 3.138 |
| 6.176371156957289 | 3.141 | 3.14 | 3.138 |
| 6.179512749610878 | 3.141 | 3.14 | 3.138 |
| 6.182654342264468 | 3.141 | 3.14 | 3.139 |
| 6.185795934918057 | 3.141 | 3.14 | 3.139 |
| 6.188937527571647 | 3.141 | 3.14 | 3.139 |
| 6.192079120225237 | 3.141 | 3.141 | 3.139 |
| 6.195220712878826 | 3.141 | 3.141 | 3.14 |
| 6.198362305532415 | 3.141 | 3.141 | 3.14 |
| 6.201503898186005 | 3.141 | 3.141 | 3.14 |
| 6.204645490839594 | 3.141 | 3.141 | 3.14 |
| 6.207787083493184 | 3.141 | 3.141 | 3.14 |
| 6.210928676146774 | 3.141 | 3.141 | 3.14 |
| 6.214070268800364 | 3.141 | 3.141 | 3.141 |
| 6.217211861453953 | 3.141 | 3.141 | 3.141 |
| 6.220353454107543 | 3.142 | 3.141 | 3.141 |
| 6.223495046761133 | 3.142 | 3.141 | 3.141 |
| 6.226636639414722 | 3.142 | 3.141 | 3.141 |
| 6.229778232068312 | 3.142 | 3.141 | 3.141 |
| 6.232919824721901 | 3.142 | 3.141 | 3.141 |
| 6.236061417375491 | 3.142 | 3.141 | 3.141 |
| 6.23920301002908 | 3.142 | 3.141 | 3.141 |
| 6.24234460268267 | 3.142 | 3.142 | 3.141 |
| 6.24548619533626 | 3.142 | 3.142 | 3.141 |
| 6.24862778798985 | 3.142 | 3.142 | 3.141 |
| 6.251769380643438 | 3.142 | 3.142 | 3.141 |
| 6.254910973297028 | 3.142 | 3.142 | 3.142 |
| 6.258052565950618 | 3.142 | 3.142 | 3.142 |
| 6.261194158604208 | 3.142 | 3.142 | 3.142 |
| 6.264335751257797 | 3.142 | 3.142 | 3.142 |
| 6.267477343911387 | 3.142 | 3.142 | 3.142 |
| 6.270618936564976 | 3.142 | 3.142 | 3.142 |
| 6.273760529218566 | 3.142 | 3.142 | 3.142 |
| 6.276902121872155 | 3.142 | 3.142 | 3.142 |
| 6.280043714525745 | 3.142 | 3.142 | 3.142 |
| 6.283185307179335 | 3.142 | 3.142 | 3.142 |